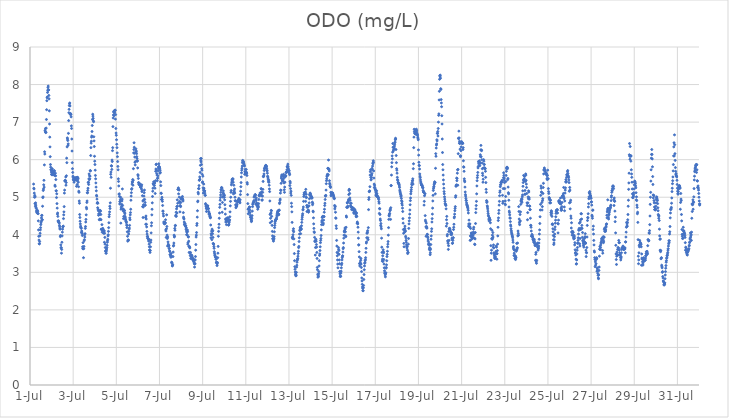
| Category | ODO (mg/L) |
|---|---|
| 44743.166666666664 | 5.35 |
| 44743.177083333336 | 5.24 |
| 44743.1875 | 5.22 |
| 44743.197916666664 | 5.11 |
| 44743.208333333336 | 5 |
| 44743.21875 | 5.05 |
| 44743.229166666664 | 4.83 |
| 44743.239583333336 | 5.01 |
| 44743.25 | 4.76 |
| 44743.260416666664 | 4.85 |
| 44743.270833333336 | 4.79 |
| 44743.28125 | 4.73 |
| 44743.291666666664 | 4.7 |
| 44743.302083333336 | 4.63 |
| 44743.3125 | 4.59 |
| 44743.322916666664 | 4.64 |
| 44743.333333333336 | 4.63 |
| 44743.34375 | 4.65 |
| 44743.354166666664 | 4.62 |
| 44743.364583333336 | 4.57 |
| 44743.375 | 4.56 |
| 44743.385416666664 | 4.37 |
| 44743.395833333336 | 4.13 |
| 44743.40625 | 3.96 |
| 44743.416666666664 | 3.86 |
| 44743.427083333336 | 3.76 |
| 44743.4375 | 3.76 |
| 44743.447916666664 | 3.82 |
| 44743.458333333336 | 3.97 |
| 44743.46875 | 4.04 |
| 44743.479166666664 | 4.13 |
| 44743.489583333336 | 4.19 |
| 44743.5 | 4.27 |
| 44743.510416666664 | 4.32 |
| 44743.520833333336 | 4.36 |
| 44743.53125 | 4.45 |
| 44743.541666666664 | 4.51 |
| 44743.552083333336 | 4.52 |
| 44743.5625 | 4.4 |
| 44743.572916666664 | 4.4 |
| 44743.583333333336 | 4.76 |
| 44743.59375 | 4.99 |
| 44743.604166666664 | 5.01 |
| 44743.614583333336 | 5.18 |
| 44743.625 | 5.22 |
| 44743.635416666664 | 5.33 |
| 44743.645833333336 | 5.45 |
| 44743.65625 | 5.27 |
| 44743.666666666664 | 5.86 |
| 44743.677083333336 | 6.21 |
| 44743.6875 | 6.15 |
| 44743.697916666664 | 6.78 |
| 44743.708333333336 | 6.74 |
| 44743.71875 | 6.83 |
| 44743.729166666664 | 6.72 |
| 44743.739583333336 | 6.73 |
| 44743.75 | 6.84 |
| 44743.760416666664 | 7.07 |
| 44743.770833333336 | 7.33 |
| 44743.78125 | 7.57 |
| 44743.791666666664 | 7.65 |
| 44743.802083333336 | 7.67 |
| 44743.8125 | 7.79 |
| 44743.822916666664 | 7.85 |
| 44743.833333333336 | 7.92 |
| 44743.84375 | 7.96 |
| 44743.854166666664 | 7.85 |
| 44743.864583333336 | 7.86 |
| 44743.875 | 7.71 |
| 44743.885416666664 | 7.62 |
| 44743.895833333336 | 7.3 |
| 44743.90625 | 6.95 |
| 44743.916666666664 | 6.6 |
| 44743.927083333336 | 6.34 |
| 44743.9375 | 6.08 |
| 44743.947916666664 | 5.87 |
| 44743.958333333336 | 5.8 |
| 44743.96875 | 5.73 |
| 44743.979166666664 | 5.73 |
| 44743.989583333336 | 5.67 |
| 44744.0 | 5.61 |
| 44744.010416666664 | 5.6 |
| 44744.020833333336 | 5.68 |
| 44744.03125 | 5.76 |
| 44744.041666666664 | 5.7 |
| 44744.052083333336 | 5.6 |
| 44744.0625 | 5.67 |
| 44744.072916666664 | 5.65 |
| 44744.083333333336 | 5.6 |
| 44744.09375 | 5.65 |
| 44744.104166666664 | 5.62 |
| 44744.114583333336 | 5.71 |
| 44744.125 | 5.62 |
| 44744.135416666664 | 5.7 |
| 44744.145833333336 | 5.58 |
| 44744.15625 | 5.32 |
| 44744.166666666664 | 5.29 |
| 44744.177083333336 | 5.64 |
| 44744.1875 | 5.57 |
| 44744.197916666664 | 5.47 |
| 44744.208333333336 | 5.17 |
| 44744.21875 | 5.17 |
| 44744.229166666664 | 4.99 |
| 44744.239583333336 | 5.09 |
| 44744.25 | 4.83 |
| 44744.260416666664 | 4.71 |
| 44744.270833333336 | 4.55 |
| 44744.28125 | 4.58 |
| 44744.291666666664 | 4.49 |
| 44744.302083333336 | 4.37 |
| 44744.3125 | 4.35 |
| 44744.322916666664 | 4.37 |
| 44744.333333333336 | 4.34 |
| 44744.34375 | 4.33 |
| 44744.354166666664 | 4.31 |
| 44744.364583333336 | 4.25 |
| 44744.375 | 4.21 |
| 44744.385416666664 | 4.16 |
| 44744.395833333336 | 4.15 |
| 44744.40625 | 3.95 |
| 44744.416666666664 | 3.98 |
| 44744.427083333336 | 3.73 |
| 44744.4375 | 3.65 |
| 44744.447916666664 | 3.66 |
| 44744.458333333336 | 3.51 |
| 44744.46875 | 3.61 |
| 44744.479166666664 | 3.8 |
| 44744.489583333336 | 3.97 |
| 44744.5 | 4.07 |
| 44744.510416666664 | 4.15 |
| 44744.520833333336 | 4.21 |
| 44744.53125 | 4.22 |
| 44744.541666666664 | 4.23 |
| 44744.552083333336 | 4.43 |
| 44744.5625 | 4.53 |
| 44744.572916666664 | 4.61 |
| 44744.583333333336 | 4.75 |
| 44744.59375 | 5.11 |
| 44744.604166666664 | 5.19 |
| 44744.614583333336 | 5.43 |
| 44744.625 | 5.44 |
| 44744.635416666664 | 5.45 |
| 44744.645833333336 | 5.44 |
| 44744.65625 | 5.54 |
| 44744.666666666664 | 5.32 |
| 44744.677083333336 | 5.39 |
| 44744.6875 | 5.57 |
| 44744.697916666664 | 6.04 |
| 44744.708333333336 | 5.92 |
| 44744.71875 | 6.34 |
| 44744.729166666664 | 6.58 |
| 44744.739583333336 | 6.55 |
| 44744.75 | 6.51 |
| 44744.760416666664 | 6.38 |
| 44744.770833333336 | 6.42 |
| 44744.78125 | 6.7 |
| 44744.791666666664 | 7.04 |
| 44744.802083333336 | 7.25 |
| 44744.8125 | 7.34 |
| 44744.822916666664 | 7.44 |
| 44744.833333333336 | 7.49 |
| 44744.84375 | 7.51 |
| 44744.854166666664 | 7.43 |
| 44744.864583333336 | 7.21 |
| 44744.875 | 7.23 |
| 44744.885416666664 | 7.2 |
| 44744.895833333336 | 7.21 |
| 44744.90625 | 7.14 |
| 44744.916666666664 | 6.9 |
| 44744.927083333336 | 6.83 |
| 44744.9375 | 6.55 |
| 44744.947916666664 | 6.23 |
| 44744.958333333336 | 5.92 |
| 44744.96875 | 5.76 |
| 44744.979166666664 | 5.66 |
| 44744.989583333336 | 5.56 |
| 44745.0 | 5.52 |
| 44745.010416666664 | 5.47 |
| 44745.020833333336 | 5.46 |
| 44745.03125 | 5.46 |
| 44745.041666666664 | 5.4 |
| 44745.052083333336 | 5.45 |
| 44745.0625 | 5.5 |
| 44745.072916666664 | 5.52 |
| 44745.083333333336 | 5.5 |
| 44745.09375 | 5.48 |
| 44745.104166666664 | 5.49 |
| 44745.114583333336 | 5.52 |
| 44745.125 | 5.49 |
| 44745.135416666664 | 5.45 |
| 44745.15625 | 5.29 |
| 44745.166666666664 | 5.52 |
| 44745.177083333336 | 5.53 |
| 44745.1875 | 5.34 |
| 44745.197916666664 | 5.44 |
| 44745.208333333336 | 5.53 |
| 44745.21875 | 5.51 |
| 44745.229166666664 | 5.49 |
| 44745.239583333336 | 5.4 |
| 44745.25 | 5.28 |
| 44745.260416666664 | 5.16 |
| 44745.270833333336 | 5.13 |
| 44745.28125 | 4.9 |
| 44745.291666666664 | 4.84 |
| 44745.302083333336 | 4.54 |
| 44745.3125 | 4.46 |
| 44745.322916666664 | 4.36 |
| 44745.333333333336 | 4.29 |
| 44745.34375 | 4.23 |
| 44745.354166666664 | 4.2 |
| 44745.364583333336 | 4.19 |
| 44745.375 | 4.17 |
| 44745.385416666664 | 4.06 |
| 44745.395833333336 | 4.1 |
| 44745.40625 | 4.07 |
| 44745.416666666664 | 4.03 |
| 44745.427083333336 | 3.98 |
| 44745.4375 | 3.68 |
| 44745.447916666664 | 3.63 |
| 44745.458333333336 | 3.79 |
| 44745.46875 | 3.63 |
| 44745.479166666664 | 3.39 |
| 44745.489583333336 | 3.63 |
| 44745.5 | 3.69 |
| 44745.510416666664 | 3.84 |
| 44745.520833333336 | 3.87 |
| 44745.53125 | 4 |
| 44745.541666666664 | 3.94 |
| 44745.552083333336 | 4.03 |
| 44745.5625 | 4.17 |
| 44745.572916666664 | 4.22 |
| 44745.583333333336 | 4.34 |
| 44745.59375 | 4.41 |
| 44745.604166666664 | 4.53 |
| 44745.614583333336 | 4.73 |
| 44745.625 | 4.69 |
| 44745.635416666664 | 4.86 |
| 44745.645833333336 | 4.9 |
| 44745.65625 | 5.12 |
| 44745.666666666664 | 5.12 |
| 44745.677083333336 | 5.18 |
| 44745.6875 | 5.24 |
| 44745.697916666664 | 5.39 |
| 44745.708333333336 | 5.4 |
| 44745.71875 | 5.34 |
| 44745.729166666664 | 5.49 |
| 44745.739583333336 | 5.62 |
| 44745.75 | 5.47 |
| 44745.760416666664 | 5.57 |
| 44745.770833333336 | 5.49 |
| 44745.78125 | 5.56 |
| 44745.791666666664 | 5.71 |
| 44745.802083333336 | 5.7 |
| 44745.8125 | 6.11 |
| 44745.822916666664 | 6.32 |
| 44745.833333333336 | 6.44 |
| 44745.84375 | 6.49 |
| 44745.854166666664 | 6.6 |
| 44745.864583333336 | 6.63 |
| 44745.875 | 6.75 |
| 44745.885416666664 | 6.91 |
| 44745.895833333336 | 7.07 |
| 44745.90625 | 7.21 |
| 44745.916666666664 | 7.16 |
| 44745.927083333336 | 7.1 |
| 44745.9375 | 7.03 |
| 44745.947916666664 | 7.01 |
| 44745.958333333336 | 6.61 |
| 44745.96875 | 6.5 |
| 44745.979166666664 | 6.35 |
| 44745.989583333336 | 6.09 |
| 44746.0 | 5.96 |
| 44746.010416666664 | 5.87 |
| 44746.020833333336 | 5.72 |
| 44746.03125 | 5.58 |
| 44746.041666666664 | 5.49 |
| 44746.052083333336 | 5.38 |
| 44746.0625 | 5.27 |
| 44746.072916666664 | 5.17 |
| 44746.083333333336 | 5.05 |
| 44746.09375 | 5.03 |
| 44746.104166666664 | 4.95 |
| 44746.114583333336 | 4.84 |
| 44746.125 | 4.86 |
| 44746.135416666664 | 4.72 |
| 44746.145833333336 | 4.84 |
| 44746.15625 | 4.68 |
| 44746.166666666664 | 4.64 |
| 44746.177083333336 | 4.52 |
| 44746.1875 | 4.56 |
| 44746.197916666664 | 4.64 |
| 44746.208333333336 | 4.4 |
| 44746.21875 | 4.54 |
| 44746.229166666664 | 4.57 |
| 44746.239583333336 | 4.42 |
| 44746.25 | 4.65 |
| 44746.260416666664 | 4.41 |
| 44746.270833333336 | 4.63 |
| 44746.28125 | 4.54 |
| 44746.291666666664 | 4.4 |
| 44746.302083333336 | 4.15 |
| 44746.3125 | 4.14 |
| 44746.322916666664 | 4.14 |
| 44746.333333333336 | 4.27 |
| 44746.34375 | 4.07 |
| 44746.354166666664 | 4.15 |
| 44746.364583333336 | 4.15 |
| 44746.375 | 4.17 |
| 44746.385416666664 | 4.12 |
| 44746.395833333336 | 4.12 |
| 44746.40625 | 4.04 |
| 44746.416666666664 | 4.08 |
| 44746.427083333336 | 4.11 |
| 44746.4375 | 4.1 |
| 44746.447916666664 | 3.8 |
| 44746.458333333336 | 4.04 |
| 44746.46875 | 3.93 |
| 44746.479166666664 | 3.75 |
| 44746.489583333336 | 3.66 |
| 44746.5 | 3.56 |
| 44746.510416666664 | 3.58 |
| 44746.520833333336 | 3.51 |
| 44746.53125 | 3.51 |
| 44746.541666666664 | 3.57 |
| 44746.552083333336 | 3.62 |
| 44746.5625 | 3.66 |
| 44746.572916666664 | 3.72 |
| 44746.583333333336 | 3.8 |
| 44746.59375 | 3.84 |
| 44746.604166666664 | 3.88 |
| 44746.614583333336 | 3.97 |
| 44746.625 | 4 |
| 44746.635416666664 | 4.09 |
| 44746.645833333336 | 4.19 |
| 44746.65625 | 4.32 |
| 44746.666666666664 | 4.48 |
| 44746.677083333336 | 4.54 |
| 44746.6875 | 4.61 |
| 44746.697916666664 | 4.76 |
| 44746.708333333336 | 4.7 |
| 44746.71875 | 4.85 |
| 44746.729166666664 | 5.24 |
| 44746.739583333336 | 5.61 |
| 44746.75 | 5.67 |
| 44746.760416666664 | 5.53 |
| 44746.770833333336 | 5.84 |
| 44746.78125 | 5.83 |
| 44746.791666666664 | 5.74 |
| 44746.802083333336 | 5.99 |
| 44746.8125 | 5.95 |
| 44746.822916666664 | 6.24 |
| 44746.833333333336 | 6.32 |
| 44746.84375 | 6.88 |
| 44746.854166666664 | 7.11 |
| 44746.864583333336 | 7.19 |
| 44746.875 | 7.27 |
| 44746.885416666664 | 7.29 |
| 44746.895833333336 | 7.17 |
| 44746.90625 | 7.26 |
| 44746.916666666664 | 7.25 |
| 44746.927083333336 | 7.31 |
| 44746.9375 | 7.31 |
| 44746.947916666664 | 7.32 |
| 44746.958333333336 | 7.08 |
| 44746.96875 | 7.2 |
| 44746.979166666664 | 6.83 |
| 44746.989583333336 | 6.71 |
| 44747.0 | 6.65 |
| 44747.010416666664 | 6.53 |
| 44747.020833333336 | 6.41 |
| 44747.03125 | 6.32 |
| 44747.041666666664 | 6.18 |
| 44747.052083333336 | 6.08 |
| 44747.0625 | 5.95 |
| 44747.072916666664 | 5.82 |
| 44747.083333333336 | 5.73 |
| 44747.09375 | 5.49 |
| 44747.104166666664 | 5.42 |
| 44747.114583333336 | 5.3 |
| 44747.125 | 5.08 |
| 44747.135416666664 | 5.09 |
| 44747.145833333336 | 5.02 |
| 44747.15625 | 4.82 |
| 44747.166666666664 | 4.88 |
| 44747.177083333336 | 4.89 |
| 44747.1875 | 4.94 |
| 44747.197916666664 | 5 |
| 44747.208333333336 | 4.31 |
| 44747.21875 | 4.68 |
| 44747.229166666664 | 4.72 |
| 44747.239583333336 | 4.76 |
| 44747.25 | 4.81 |
| 44747.260416666664 | 4.9 |
| 44747.270833333336 | 4.95 |
| 44747.28125 | 5.22 |
| 44747.291666666664 | 4.78 |
| 44747.302083333336 | 4.68 |
| 44747.3125 | 4.69 |
| 44747.322916666664 | 4.63 |
| 44747.333333333336 | 4.43 |
| 44747.34375 | 4.49 |
| 44747.354166666664 | 4.66 |
| 44747.364583333336 | 4.65 |
| 44747.375 | 4.64 |
| 44747.385416666664 | 4.59 |
| 44747.395833333336 | 4.56 |
| 44747.40625 | 4.49 |
| 44747.416666666664 | 4.45 |
| 44747.427083333336 | 4.41 |
| 44747.4375 | 4.39 |
| 44747.447916666664 | 4.36 |
| 44747.458333333336 | 4.35 |
| 44747.46875 | 4.32 |
| 44747.479166666664 | 4.26 |
| 44747.489583333336 | 4.19 |
| 44747.5 | 4.25 |
| 44747.510416666664 | 4.08 |
| 44747.520833333336 | 3.96 |
| 44747.53125 | 3.83 |
| 44747.541666666664 | 3.86 |
| 44747.552083333336 | 3.85 |
| 44747.5625 | 3.86 |
| 44747.572916666664 | 4.02 |
| 44747.583333333336 | 4.09 |
| 44747.59375 | 4.15 |
| 44747.604166666664 | 4.18 |
| 44747.614583333336 | 4.25 |
| 44747.625 | 4.45 |
| 44747.635416666664 | 4.4 |
| 44747.645833333336 | 4.53 |
| 44747.65625 | 4.59 |
| 44747.666666666664 | 4.68 |
| 44747.677083333336 | 4.92 |
| 44747.6875 | 5.03 |
| 44747.697916666664 | 5.12 |
| 44747.708333333336 | 5.21 |
| 44747.71875 | 5.23 |
| 44747.729166666664 | 5.35 |
| 44747.739583333336 | 5.41 |
| 44747.75 | 5.4 |
| 44747.760416666664 | 5.47 |
| 44747.770833333336 | 5.32 |
| 44747.78125 | 5.45 |
| 44747.791666666664 | 5.76 |
| 44747.802083333336 | 6.18 |
| 44747.8125 | 6.27 |
| 44747.822916666664 | 6.45 |
| 44747.833333333336 | 6.33 |
| 44747.84375 | 6.17 |
| 44747.854166666664 | 6.07 |
| 44747.864583333336 | 5.93 |
| 44747.875 | 5.86 |
| 44747.885416666664 | 5.95 |
| 44747.895833333336 | 6.2 |
| 44747.90625 | 6.29 |
| 44747.916666666664 | 6.24 |
| 44747.927083333336 | 6.21 |
| 44747.9375 | 6.16 |
| 44747.947916666664 | 6.08 |
| 44747.958333333336 | 6.03 |
| 44747.96875 | 5.96 |
| 44747.979166666664 | 5.97 |
| 44747.989583333336 | 5.78 |
| 44748.0 | 5.6 |
| 44748.010416666664 | 5.57 |
| 44748.020833333336 | 5.5 |
| 44748.03125 | 5.39 |
| 44748.041666666664 | 5.38 |
| 44748.052083333336 | 5.34 |
| 44748.0625 | 5.34 |
| 44748.072916666664 | 5.33 |
| 44748.083333333336 | 5.36 |
| 44748.09375 | 5.33 |
| 44748.104166666664 | 5.33 |
| 44748.114583333336 | 5.27 |
| 44748.125 | 5.28 |
| 44748.135416666664 | 5.26 |
| 44748.145833333336 | 5.3 |
| 44748.15625 | 5.28 |
| 44748.166666666664 | 5.22 |
| 44748.177083333336 | 5.33 |
| 44748.1875 | 5.15 |
| 44748.197916666664 | 5.17 |
| 44748.208333333336 | 5.04 |
| 44748.21875 | 4.75 |
| 44748.229166666664 | 4.9 |
| 44748.239583333336 | 4.46 |
| 44748.25 | 4.74 |
| 44748.260416666664 | 4.8 |
| 44748.270833333336 | 4.93 |
| 44748.28125 | 5.03 |
| 44748.291666666664 | 5.12 |
| 44748.302083333336 | 5.19 |
| 44748.3125 | 4.94 |
| 44748.322916666664 | 4.78 |
| 44748.333333333336 | 4.86 |
| 44748.34375 | 4.79 |
| 44748.354166666664 | 4.46 |
| 44748.364583333336 | 4.28 |
| 44748.375 | 4.5 |
| 44748.385416666664 | 4.42 |
| 44748.395833333336 | 4.28 |
| 44748.40625 | 4.21 |
| 44748.416666666664 | 4.09 |
| 44748.427083333336 | 4.02 |
| 44748.4375 | 3.95 |
| 44748.447916666664 | 3.96 |
| 44748.458333333336 | 3.91 |
| 44748.46875 | 3.9 |
| 44748.479166666664 | 3.9 |
| 44748.489583333336 | 3.87 |
| 44748.5 | 3.83 |
| 44748.510416666664 | 3.87 |
| 44748.520833333336 | 3.75 |
| 44748.53125 | 3.68 |
| 44748.541666666664 | 3.6 |
| 44748.552083333336 | 3.58 |
| 44748.5625 | 3.53 |
| 44748.572916666664 | 3.58 |
| 44748.583333333336 | 3.68 |
| 44748.59375 | 3.8 |
| 44748.604166666664 | 3.86 |
| 44748.614583333336 | 4.05 |
| 44748.625 | 4.24 |
| 44748.635416666664 | 4.32 |
| 44748.645833333336 | 4.53 |
| 44748.65625 | 4.68 |
| 44748.666666666664 | 4.85 |
| 44748.677083333336 | 5.02 |
| 44748.6875 | 5.16 |
| 44748.697916666664 | 5.24 |
| 44748.708333333336 | 5.36 |
| 44748.71875 | 5.35 |
| 44748.729166666664 | 5.41 |
| 44748.739583333336 | 5.35 |
| 44748.75 | 5.32 |
| 44748.760416666664 | 5.31 |
| 44748.770833333336 | 5.38 |
| 44748.78125 | 5.38 |
| 44748.791666666664 | 5.24 |
| 44748.802083333336 | 5.1 |
| 44748.8125 | 5.44 |
| 44748.822916666664 | 5.69 |
| 44748.833333333336 | 5.75 |
| 44748.84375 | 5.87 |
| 44748.854166666664 | 5.88 |
| 44748.864583333336 | 5.72 |
| 44748.875 | 5.63 |
| 44748.885416666664 | 5.59 |
| 44748.895833333336 | 5.44 |
| 44748.90625 | 5.5 |
| 44748.916666666664 | 5.51 |
| 44748.927083333336 | 5.57 |
| 44748.9375 | 5.7 |
| 44748.947916666664 | 5.8 |
| 44748.958333333336 | 5.76 |
| 44748.96875 | 5.89 |
| 44748.979166666664 | 5.82 |
| 44748.989583333336 | 5.81 |
| 44749.0 | 5.79 |
| 44749.010416666664 | 5.77 |
| 44749.020833333336 | 5.64 |
| 44749.03125 | 5.72 |
| 44749.041666666664 | 5.66 |
| 44749.052083333336 | 5.41 |
| 44749.0625 | 5.31 |
| 44749.072916666664 | 5.11 |
| 44749.083333333336 | 5.1 |
| 44749.09375 | 4.94 |
| 44749.104166666664 | 4.94 |
| 44749.114583333336 | 5 |
| 44749.125 | 4.94 |
| 44749.135416666664 | 4.89 |
| 44749.145833333336 | 4.78 |
| 44749.15625 | 4.63 |
| 44749.166666666664 | 4.63 |
| 44749.177083333336 | 4.56 |
| 44749.1875 | 4.5 |
| 44749.197916666664 | 4.34 |
| 44749.208333333336 | 4.31 |
| 44749.21875 | 4.31 |
| 44749.229166666664 | 4.29 |
| 44749.239583333336 | 4.33 |
| 44749.25 | 4.32 |
| 44749.260416666664 | 4.3 |
| 44749.270833333336 | 4.32 |
| 44749.28125 | 4.4 |
| 44749.291666666664 | 4.13 |
| 44749.302083333336 | 4.1 |
| 44749.3125 | 3.93 |
| 44749.322916666664 | 4.16 |
| 44749.333333333336 | 4.53 |
| 44749.34375 | 4.22 |
| 44749.354166666664 | 3.99 |
| 44749.364583333336 | 3.9 |
| 44749.375 | 3.7 |
| 44749.385416666664 | 3.94 |
| 44749.395833333336 | 3.81 |
| 44749.40625 | 3.75 |
| 44749.416666666664 | 3.72 |
| 44749.427083333336 | 3.7 |
| 44749.4375 | 3.71 |
| 44749.447916666664 | 3.63 |
| 44749.458333333336 | 3.64 |
| 44749.46875 | 3.57 |
| 44749.479166666664 | 3.55 |
| 44749.489583333336 | 3.47 |
| 44749.5 | 3.47 |
| 44749.510416666664 | 3.45 |
| 44749.520833333336 | 3.43 |
| 44749.53125 | 3.4 |
| 44749.541666666664 | 3.5 |
| 44749.552083333336 | 3.43 |
| 44749.5625 | 3.27 |
| 44749.572916666664 | 3.26 |
| 44749.583333333336 | 3.24 |
| 44749.59375 | 3.17 |
| 44749.604166666664 | 3.18 |
| 44749.614583333336 | 3.2 |
| 44749.625 | 3.42 |
| 44749.635416666664 | 3.54 |
| 44749.645833333336 | 3.7 |
| 44749.65625 | 3.72 |
| 44749.666666666664 | 3.78 |
| 44749.677083333336 | 3.99 |
| 44749.6875 | 3.94 |
| 44749.697916666664 | 3.96 |
| 44749.708333333336 | 4.17 |
| 44749.71875 | 4.12 |
| 44749.729166666664 | 4.24 |
| 44749.739583333336 | 4.25 |
| 44749.75 | 4.5 |
| 44749.760416666664 | 4.52 |
| 44749.770833333336 | 4.6 |
| 44749.78125 | 4.49 |
| 44749.791666666664 | 4.69 |
| 44749.802083333336 | 4.75 |
| 44749.8125 | 4.58 |
| 44749.822916666664 | 4.93 |
| 44749.833333333336 | 4.76 |
| 44749.84375 | 4.84 |
| 44749.854166666664 | 5.21 |
| 44749.864583333336 | 5.21 |
| 44749.875 | 5.25 |
| 44749.885416666664 | 5.09 |
| 44749.895833333336 | 5.21 |
| 44749.90625 | 5.19 |
| 44749.916666666664 | 5 |
| 44749.927083333336 | 4.89 |
| 44749.9375 | 4.86 |
| 44749.947916666664 | 4.61 |
| 44749.958333333336 | 4.78 |
| 44749.96875 | 4.76 |
| 44749.979166666664 | 4.75 |
| 44749.989583333336 | 4.86 |
| 44750.0 | 4.95 |
| 44750.010416666664 | 4.99 |
| 44750.020833333336 | 4.96 |
| 44750.03125 | 4.96 |
| 44750.041666666664 | 4.96 |
| 44750.052083333336 | 4.98 |
| 44750.0625 | 5.02 |
| 44750.072916666664 | 4.95 |
| 44750.083333333336 | 4.93 |
| 44750.09375 | 4.9 |
| 44750.104166666664 | 4.59 |
| 44750.114583333336 | 4.47 |
| 44750.125 | 4.44 |
| 44750.135416666664 | 4.42 |
| 44750.145833333336 | 4.34 |
| 44750.15625 | 4.28 |
| 44750.166666666664 | 4.27 |
| 44750.177083333336 | 4.26 |
| 44750.1875 | 4.3 |
| 44750.197916666664 | 4.24 |
| 44750.208333333336 | 4.23 |
| 44750.21875 | 4.24 |
| 44750.229166666664 | 4.15 |
| 44750.239583333336 | 4.19 |
| 44750.25 | 4.1 |
| 44750.260416666664 | 4 |
| 44750.270833333336 | 4.06 |
| 44750.28125 | 4 |
| 44750.291666666664 | 4.13 |
| 44750.302083333336 | 4.09 |
| 44750.3125 | 3.75 |
| 44750.322916666664 | 3.79 |
| 44750.333333333336 | 3.94 |
| 44750.34375 | 3.95 |
| 44750.354166666664 | 3.83 |
| 44750.364583333336 | 3.69 |
| 44750.375 | 3.53 |
| 44750.385416666664 | 3.69 |
| 44750.395833333336 | 3.67 |
| 44750.40625 | 3.65 |
| 44750.416666666664 | 3.51 |
| 44750.427083333336 | 3.45 |
| 44750.4375 | 3.53 |
| 44750.447916666664 | 3.37 |
| 44750.458333333336 | 3.42 |
| 44750.46875 | 3.46 |
| 44750.479166666664 | 3.45 |
| 44750.489583333336 | 3.42 |
| 44750.5 | 3.45 |
| 44750.510416666664 | 3.41 |
| 44750.520833333336 | 3.35 |
| 44750.53125 | 3.38 |
| 44750.541666666664 | 3.34 |
| 44750.552083333336 | 3.36 |
| 44750.5625 | 3.31 |
| 44750.572916666664 | 3.35 |
| 44750.583333333336 | 3.34 |
| 44750.59375 | 3.3 |
| 44750.604166666664 | 3.26 |
| 44750.614583333336 | 3.23 |
| 44750.625 | 3.14 |
| 44750.635416666664 | 3.22 |
| 44750.645833333336 | 3.23 |
| 44750.65625 | 3.33 |
| 44750.666666666664 | 3.42 |
| 44750.677083333336 | 3.59 |
| 44750.6875 | 3.74 |
| 44750.697916666664 | 3.94 |
| 44750.708333333336 | 3.99 |
| 44750.71875 | 4.06 |
| 44750.729166666664 | 4.25 |
| 44750.739583333336 | 4.3 |
| 44750.75 | 4.47 |
| 44750.760416666664 | 4.64 |
| 44750.770833333336 | 4.88 |
| 44750.78125 | 4.9 |
| 44750.791666666664 | 5.13 |
| 44750.802083333336 | 5.09 |
| 44750.8125 | 5.23 |
| 44750.822916666664 | 5.23 |
| 44750.833333333336 | 5.31 |
| 44750.84375 | 5.45 |
| 44750.854166666664 | 5.46 |
| 44750.864583333336 | 5.54 |
| 44750.875 | 5.48 |
| 44750.885416666664 | 5.66 |
| 44750.895833333336 | 5.85 |
| 44750.90625 | 6.03 |
| 44750.916666666664 | 5.97 |
| 44750.927083333336 | 5.94 |
| 44750.9375 | 6.03 |
| 44750.947916666664 | 5.87 |
| 44750.958333333336 | 5.76 |
| 44750.96875 | 5.72 |
| 44750.979166666664 | 5.61 |
| 44750.989583333336 | 5.39 |
| 44751.0 | 5.41 |
| 44751.010416666664 | 5.56 |
| 44751.020833333336 | 5.25 |
| 44751.03125 | 5.11 |
| 44751.041666666664 | 5.19 |
| 44751.052083333336 | 5.35 |
| 44751.0625 | 5.24 |
| 44751.072916666664 | 5.16 |
| 44751.083333333336 | 5.17 |
| 44751.09375 | 5.17 |
| 44751.104166666664 | 5.11 |
| 44751.114583333336 | 5.05 |
| 44751.125 | 5.05 |
| 44751.135416666664 | 4.83 |
| 44751.145833333336 | 4.8 |
| 44751.15625 | 4.76 |
| 44751.166666666664 | 4.71 |
| 44751.177083333336 | 4.62 |
| 44751.1875 | 4.7 |
| 44751.197916666664 | 4.68 |
| 44751.208333333336 | 4.76 |
| 44751.21875 | 4.74 |
| 44751.229166666664 | 4.77 |
| 44751.239583333336 | 4.77 |
| 44751.25 | 4.7 |
| 44751.260416666664 | 4.69 |
| 44751.270833333336 | 4.7 |
| 44751.28125 | 4.62 |
| 44751.291666666664 | 4.58 |
| 44751.302083333336 | 4.54 |
| 44751.3125 | 4.57 |
| 44751.322916666664 | 4.55 |
| 44751.333333333336 | 4.48 |
| 44751.34375 | 4.5 |
| 44751.354166666664 | 4.45 |
| 44751.364583333336 | 4.46 |
| 44751.375 | 4.26 |
| 44751.385416666664 | 3.92 |
| 44751.395833333336 | 4.03 |
| 44751.40625 | 3.99 |
| 44751.416666666664 | 4.1 |
| 44751.427083333336 | 3.87 |
| 44751.4375 | 4.15 |
| 44751.447916666664 | 4.09 |
| 44751.458333333336 | 4.03 |
| 44751.46875 | 4.11 |
| 44751.479166666664 | 3.93 |
| 44751.489583333336 | 3.77 |
| 44751.5 | 3.76 |
| 44751.510416666664 | 3.75 |
| 44751.520833333336 | 3.69 |
| 44751.53125 | 3.64 |
| 44751.541666666664 | 3.55 |
| 44751.552083333336 | 3.51 |
| 44751.5625 | 3.46 |
| 44751.572916666664 | 3.46 |
| 44751.583333333336 | 3.41 |
| 44751.59375 | 3.42 |
| 44751.604166666664 | 3.4 |
| 44751.614583333336 | 3.35 |
| 44751.625 | 3.35 |
| 44751.635416666664 | 3.27 |
| 44751.645833333336 | 3.25 |
| 44751.65625 | 3.26 |
| 44751.666666666664 | 3.18 |
| 44751.677083333336 | 3.23 |
| 44751.6875 | 3.26 |
| 44751.697916666664 | 3.39 |
| 44751.708333333336 | 3.51 |
| 44751.71875 | 3.69 |
| 44751.729166666664 | 3.96 |
| 44751.739583333336 | 4.09 |
| 44751.75 | 4.19 |
| 44751.760416666664 | 4.28 |
| 44751.770833333336 | 4.44 |
| 44751.78125 | 4.58 |
| 44751.791666666664 | 4.73 |
| 44751.802083333336 | 4.81 |
| 44751.8125 | 4.92 |
| 44751.822916666664 | 4.99 |
| 44751.833333333336 | 5.06 |
| 44751.84375 | 5.13 |
| 44751.854166666664 | 5.2 |
| 44751.864583333336 | 5.2 |
| 44751.875 | 5.26 |
| 44751.885416666664 | 5.25 |
| 44751.895833333336 | 5.24 |
| 44751.90625 | 4.6 |
| 44751.916666666664 | 4.86 |
| 44751.927083333336 | 5.01 |
| 44751.9375 | 5.01 |
| 44751.947916666664 | 5.12 |
| 44751.958333333336 | 5.17 |
| 44751.96875 | 5.09 |
| 44751.979166666664 | 5.07 |
| 44751.989583333336 | 5 |
| 44752.0 | 5 |
| 44752.010416666664 | 5.05 |
| 44752.020833333336 | 4.93 |
| 44752.03125 | 4.8 |
| 44752.041666666664 | 4.69 |
| 44752.052083333336 | 4.55 |
| 44752.0625 | 4.42 |
| 44752.072916666664 | 4.34 |
| 44752.083333333336 | 4.39 |
| 44752.09375 | 4.41 |
| 44752.104166666664 | 4.27 |
| 44752.114583333336 | 4.36 |
| 44752.125 | 4.38 |
| 44752.135416666664 | 4.45 |
| 44752.145833333336 | 4.41 |
| 44752.15625 | 4.4 |
| 44752.166666666664 | 4.44 |
| 44752.177083333336 | 4.45 |
| 44752.1875 | 4.35 |
| 44752.197916666664 | 4.26 |
| 44752.208333333336 | 4.26 |
| 44752.21875 | 4.28 |
| 44752.229166666664 | 4.33 |
| 44752.239583333336 | 4.37 |
| 44752.25 | 4.4 |
| 44752.260416666664 | 4.48 |
| 44752.270833333336 | 4.61 |
| 44752.28125 | 4.77 |
| 44752.291666666664 | 4.89 |
| 44752.302083333336 | 5 |
| 44752.3125 | 5.13 |
| 44752.322916666664 | 5.18 |
| 44752.333333333336 | 5.33 |
| 44752.34375 | 5.38 |
| 44752.354166666664 | 5.43 |
| 44752.364583333336 | 5.47 |
| 44752.375 | 5.46 |
| 44752.385416666664 | 5.49 |
| 44752.395833333336 | 5.47 |
| 44752.40625 | 5.49 |
| 44752.416666666664 | 5.4 |
| 44752.427083333336 | 5.09 |
| 44752.4375 | 5.13 |
| 44752.447916666664 | 5.32 |
| 44752.458333333336 | 5.18 |
| 44752.46875 | 5.14 |
| 44752.479166666664 | 5.22 |
| 44752.489583333336 | 5.11 |
| 44752.5 | 5 |
| 44752.510416666664 | 4.91 |
| 44752.520833333336 | 4.9 |
| 44752.53125 | 4.8 |
| 44752.541666666664 | 4.72 |
| 44752.552083333336 | 4.78 |
| 44752.5625 | 4.75 |
| 44752.572916666664 | 4.76 |
| 44752.583333333336 | 4.79 |
| 44752.59375 | 4.81 |
| 44752.604166666664 | 4.87 |
| 44752.614583333336 | 4.9 |
| 44752.625 | 4.91 |
| 44752.635416666664 | 4.92 |
| 44752.645833333336 | 4.92 |
| 44752.65625 | 4.88 |
| 44752.666666666664 | 4.92 |
| 44752.677083333336 | 4.97 |
| 44752.6875 | 4.88 |
| 44752.697916666664 | 4.89 |
| 44752.708333333336 | 4.88 |
| 44752.71875 | 4.87 |
| 44752.729166666664 | 4.85 |
| 44752.739583333336 | 4.93 |
| 44752.75 | 5.07 |
| 44752.760416666664 | 5.16 |
| 44752.770833333336 | 5.28 |
| 44752.78125 | 5.39 |
| 44752.791666666664 | 5.54 |
| 44752.802083333336 | 5.65 |
| 44752.8125 | 5.72 |
| 44752.822916666664 | 5.77 |
| 44752.833333333336 | 5.83 |
| 44752.84375 | 5.92 |
| 44752.854166666664 | 5.98 |
| 44752.864583333336 | 5.96 |
| 44752.875 | 5.96 |
| 44752.885416666664 | 5.94 |
| 44752.895833333336 | 5.93 |
| 44752.90625 | 5.9 |
| 44752.916666666664 | 5.87 |
| 44752.927083333336 | 5.85 |
| 44752.9375 | 5.83 |
| 44752.947916666664 | 5.61 |
| 44752.958333333336 | 5.68 |
| 44752.96875 | 5.74 |
| 44752.979166666664 | 5.62 |
| 44752.989583333336 | 5.63 |
| 44753.0 | 5.67 |
| 44753.010416666664 | 5.67 |
| 44753.020833333336 | 5.74 |
| 44753.03125 | 5.66 |
| 44753.041666666664 | 5.64 |
| 44753.052083333336 | 5.58 |
| 44753.0625 | 5.39 |
| 44753.072916666664 | 5.35 |
| 44753.083333333336 | 5.07 |
| 44753.09375 | 4.83 |
| 44753.104166666664 | 4.68 |
| 44753.114583333336 | 4.56 |
| 44753.125 | 4.68 |
| 44753.135416666664 | 4.7 |
| 44753.145833333336 | 4.61 |
| 44753.15625 | 4.73 |
| 44753.166666666664 | 4.74 |
| 44753.177083333336 | 4.73 |
| 44753.1875 | 4.66 |
| 44753.197916666664 | 4.59 |
| 44753.208333333336 | 4.52 |
| 44753.21875 | 4.47 |
| 44753.229166666664 | 4.46 |
| 44753.239583333336 | 4.42 |
| 44753.25 | 4.4 |
| 44753.260416666664 | 4.35 |
| 44753.270833333336 | 4.37 |
| 44753.28125 | 4.44 |
| 44753.291666666664 | 4.51 |
| 44753.302083333336 | 4.63 |
| 44753.3125 | 4.75 |
| 44753.322916666664 | 4.81 |
| 44753.333333333336 | 4.83 |
| 44753.34375 | 4.85 |
| 44753.354166666664 | 4.86 |
| 44753.364583333336 | 4.88 |
| 44753.375 | 4.91 |
| 44753.385416666664 | 5 |
| 44753.395833333336 | 5.02 |
| 44753.40625 | 5.02 |
| 44753.416666666664 | 5.03 |
| 44753.427083333336 | 5.06 |
| 44753.4375 | 5.07 |
| 44753.447916666664 | 5.06 |
| 44753.458333333336 | 4.93 |
| 44753.46875 | 4.81 |
| 44753.479166666664 | 4.91 |
| 44753.489583333336 | 4.98 |
| 44753.5 | 4.85 |
| 44753.510416666664 | 4.83 |
| 44753.520833333336 | 4.8 |
| 44753.53125 | 4.76 |
| 44753.541666666664 | 4.78 |
| 44753.552083333336 | 4.68 |
| 44753.5625 | 4.72 |
| 44753.572916666664 | 4.73 |
| 44753.583333333336 | 4.76 |
| 44753.59375 | 4.83 |
| 44753.604166666664 | 4.94 |
| 44753.614583333336 | 5.05 |
| 44753.625 | 5.04 |
| 44753.635416666664 | 5.04 |
| 44753.645833333336 | 5.06 |
| 44753.65625 | 5.11 |
| 44753.666666666664 | 5.08 |
| 44753.677083333336 | 5.06 |
| 44753.6875 | 5.1 |
| 44753.697916666664 | 5.07 |
| 44753.708333333336 | 5.23 |
| 44753.71875 | 5.22 |
| 44753.729166666664 | 5.14 |
| 44753.739583333336 | 5.04 |
| 44753.75 | 4.92 |
| 44753.760416666664 | 4.93 |
| 44753.770833333336 | 5.03 |
| 44753.78125 | 5.13 |
| 44753.791666666664 | 5.21 |
| 44753.802083333336 | 5.42 |
| 44753.8125 | 5.55 |
| 44753.822916666664 | 5.55 |
| 44753.833333333336 | 5.57 |
| 44753.84375 | 5.62 |
| 44753.854166666664 | 5.71 |
| 44753.864583333336 | 5.76 |
| 44753.875 | 5.76 |
| 44753.885416666664 | 5.79 |
| 44753.895833333336 | 5.8 |
| 44753.90625 | 5.82 |
| 44753.916666666664 | 5.84 |
| 44753.927083333336 | 5.85 |
| 44753.9375 | 5.84 |
| 44753.947916666664 | 5.82 |
| 44753.958333333336 | 5.82 |
| 44753.96875 | 5.77 |
| 44753.979166666664 | 5.72 |
| 44753.989583333336 | 5.7 |
| 44754.0 | 5.64 |
| 44754.010416666664 | 5.56 |
| 44754.020833333336 | 5.54 |
| 44754.03125 | 5.51 |
| 44754.041666666664 | 5.47 |
| 44754.052083333336 | 5.41 |
| 44754.0625 | 5.45 |
| 44754.072916666664 | 5.4 |
| 44754.083333333336 | 5.32 |
| 44754.09375 | 5.22 |
| 44754.104166666664 | 5.15 |
| 44754.114583333336 | 4.9 |
| 44754.125 | 4.54 |
| 44754.135416666664 | 4.32 |
| 44754.145833333336 | 4.44 |
| 44754.15625 | 4.57 |
| 44754.166666666664 | 4.58 |
| 44754.177083333336 | 4.65 |
| 44754.1875 | 4.64 |
| 44754.197916666664 | 4.49 |
| 44754.208333333336 | 4.36 |
| 44754.21875 | 4.25 |
| 44754.229166666664 | 4.09 |
| 44754.239583333336 | 3.97 |
| 44754.25 | 3.9 |
| 44754.260416666664 | 3.89 |
| 44754.270833333336 | 3.87 |
| 44754.28125 | 3.83 |
| 44754.291666666664 | 3.87 |
| 44754.302083333336 | 3.9 |
| 44754.3125 | 3.95 |
| 44754.322916666664 | 4.08 |
| 44754.333333333336 | 4.19 |
| 44754.34375 | 4.25 |
| 44754.354166666664 | 4.31 |
| 44754.364583333336 | 4.36 |
| 44754.375 | 4.38 |
| 44754.385416666664 | 4.41 |
| 44754.395833333336 | 4.41 |
| 44754.40625 | 4.41 |
| 44754.416666666664 | 4.42 |
| 44754.427083333336 | 4.45 |
| 44754.4375 | 4.5 |
| 44754.447916666664 | 4.53 |
| 44754.458333333336 | 4.57 |
| 44754.46875 | 4.59 |
| 44754.479166666664 | 4.62 |
| 44754.489583333336 | 4.63 |
| 44754.5 | 4.64 |
| 44754.510416666664 | 4.55 |
| 44754.520833333336 | 4.53 |
| 44754.53125 | 4.55 |
| 44754.541666666664 | 4.66 |
| 44754.552083333336 | 4.65 |
| 44754.5625 | 4.83 |
| 44754.572916666664 | 4.86 |
| 44754.583333333336 | 4.92 |
| 44754.59375 | 4.95 |
| 44754.604166666664 | 5.11 |
| 44754.614583333336 | 5.19 |
| 44754.625 | 5.18 |
| 44754.635416666664 | 5.37 |
| 44754.645833333336 | 5.51 |
| 44754.65625 | 5.55 |
| 44754.666666666664 | 5.59 |
| 44754.677083333336 | 5.59 |
| 44754.6875 | 5.48 |
| 44754.697916666664 | 5.44 |
| 44754.708333333336 | 5.43 |
| 44754.71875 | 5.44 |
| 44754.729166666664 | 5.48 |
| 44754.739583333336 | 5.56 |
| 44754.75 | 5.61 |
| 44754.760416666664 | 5.51 |
| 44754.770833333336 | 5.38 |
| 44754.78125 | 5.2 |
| 44754.791666666664 | 5.13 |
| 44754.802083333336 | 5.27 |
| 44754.8125 | 5.4 |
| 44754.822916666664 | 5.54 |
| 44754.833333333336 | 5.58 |
| 44754.84375 | 5.56 |
| 44754.854166666664 | 5.57 |
| 44754.864583333336 | 5.66 |
| 44754.875 | 5.67 |
| 44754.885416666664 | 5.66 |
| 44754.895833333336 | 5.68 |
| 44754.90625 | 5.73 |
| 44754.916666666664 | 5.82 |
| 44754.927083333336 | 5.8 |
| 44754.9375 | 5.81 |
| 44754.947916666664 | 5.88 |
| 44754.958333333336 | 5.82 |
| 44754.96875 | 5.77 |
| 44754.979166666664 | 5.72 |
| 44754.989583333336 | 5.68 |
| 44755.0 | 5.66 |
| 44755.010416666664 | 5.71 |
| 44755.020833333336 | 5.63 |
| 44755.03125 | 5.6 |
| 44755.041666666664 | 5.31 |
| 44755.052083333336 | 5.42 |
| 44755.0625 | 5.38 |
| 44755.072916666664 | 5.23 |
| 44755.083333333336 | 5.11 |
| 44755.09375 | 5.16 |
| 44755.104166666664 | 5.05 |
| 44755.114583333336 | 4.84 |
| 44755.125 | 4.75 |
| 44755.135416666664 | 4.61 |
| 44755.145833333336 | 4.33 |
| 44755.15625 | 3.93 |
| 44755.166666666664 | 3.9 |
| 44755.177083333336 | 3.94 |
| 44755.1875 | 4 |
| 44755.197916666664 | 4.11 |
| 44755.208333333336 | 4.16 |
| 44755.21875 | 4.08 |
| 44755.229166666664 | 3.89 |
| 44755.239583333336 | 3.74 |
| 44755.25 | 3.5 |
| 44755.260416666664 | 3.31 |
| 44755.270833333336 | 3.15 |
| 44755.28125 | 3.08 |
| 44755.291666666664 | 3.01 |
| 44755.302083333336 | 2.95 |
| 44755.3125 | 2.91 |
| 44755.322916666664 | 2.95 |
| 44755.333333333336 | 2.91 |
| 44755.34375 | 3 |
| 44755.354166666664 | 3.14 |
| 44755.364583333336 | 3.19 |
| 44755.375 | 3.27 |
| 44755.385416666664 | 3.32 |
| 44755.395833333336 | 3.35 |
| 44755.40625 | 3.37 |
| 44755.416666666664 | 3.43 |
| 44755.427083333336 | 3.5 |
| 44755.4375 | 3.56 |
| 44755.447916666664 | 3.66 |
| 44755.458333333336 | 3.69 |
| 44755.46875 | 3.82 |
| 44755.479166666664 | 3.92 |
| 44755.489583333336 | 4.02 |
| 44755.5 | 4.11 |
| 44755.510416666664 | 4.13 |
| 44755.520833333336 | 4.2 |
| 44755.53125 | 4.17 |
| 44755.541666666664 | 4.03 |
| 44755.552083333336 | 4.14 |
| 44755.5625 | 4.17 |
| 44755.572916666664 | 4.15 |
| 44755.583333333336 | 4.24 |
| 44755.59375 | 4.33 |
| 44755.604166666664 | 4.41 |
| 44755.614583333336 | 4.47 |
| 44755.625 | 4.52 |
| 44755.635416666664 | 4.56 |
| 44755.645833333336 | 4.66 |
| 44755.65625 | 4.68 |
| 44755.666666666664 | 4.74 |
| 44755.677083333336 | 4.89 |
| 44755.6875 | 5.02 |
| 44755.697916666664 | 5.07 |
| 44755.708333333336 | 5.12 |
| 44755.71875 | 5.09 |
| 44755.729166666664 | 5.08 |
| 44755.739583333336 | 5.08 |
| 44755.75 | 5.12 |
| 44755.760416666664 | 5.14 |
| 44755.770833333336 | 4.89 |
| 44755.78125 | 5.21 |
| 44755.791666666664 | 5 |
| 44755.802083333336 | 5.08 |
| 44755.8125 | 4.99 |
| 44755.822916666664 | 4.78 |
| 44755.833333333336 | 4.62 |
| 44755.84375 | 4.73 |
| 44755.854166666664 | 4.76 |
| 44755.864583333336 | 4.75 |
| 44755.875 | 4.77 |
| 44755.885416666664 | 4.75 |
| 44755.895833333336 | 4.66 |
| 44755.90625 | 4.6 |
| 44755.916666666664 | 4.63 |
| 44755.927083333336 | 4.77 |
| 44755.9375 | 4.85 |
| 44755.947916666664 | 4.96 |
| 44755.958333333336 | 5.06 |
| 44755.96875 | 5.07 |
| 44755.979166666664 | 5.11 |
| 44755.989583333336 | 5.1 |
| 44756.0 | 5.07 |
| 44756.010416666664 | 5.04 |
| 44756.020833333336 | 5.02 |
| 44756.03125 | 4.98 |
| 44756.041666666664 | 5.02 |
| 44756.052083333336 | 4.99 |
| 44756.0625 | 4.98 |
| 44756.072916666664 | 4.98 |
| 44756.083333333336 | 4.87 |
| 44756.09375 | 4.8 |
| 44756.104166666664 | 4.84 |
| 44756.114583333336 | 4.63 |
| 44756.125 | 4.61 |
| 44756.135416666664 | 4.45 |
| 44756.145833333336 | 4.29 |
| 44756.15625 | 4.17 |
| 44756.166666666664 | 4.08 |
| 44756.177083333336 | 4.06 |
| 44756.1875 | 3.93 |
| 44756.197916666664 | 3.82 |
| 44756.208333333336 | 3.84 |
| 44756.21875 | 3.46 |
| 44756.229166666664 | 3.66 |
| 44756.239583333336 | 3.83 |
| 44756.25 | 3.88 |
| 44756.260416666664 | 3.83 |
| 44756.270833333336 | 3.74 |
| 44756.28125 | 3.67 |
| 44756.291666666664 | 3.53 |
| 44756.302083333336 | 3.37 |
| 44756.3125 | 3.13 |
| 44756.322916666664 | 3.07 |
| 44756.333333333336 | 2.95 |
| 44756.34375 | 2.87 |
| 44756.354166666664 | 2.91 |
| 44756.364583333336 | 2.89 |
| 44756.375 | 2.96 |
| 44756.385416666664 | 3.02 |
| 44756.395833333336 | 3.17 |
| 44756.40625 | 3.31 |
| 44756.416666666664 | 3.45 |
| 44756.427083333336 | 3.49 |
| 44756.4375 | 3.58 |
| 44756.447916666664 | 3.68 |
| 44756.458333333336 | 3.79 |
| 44756.46875 | 3.85 |
| 44756.479166666664 | 3.9 |
| 44756.489583333336 | 3.98 |
| 44756.5 | 4.13 |
| 44756.510416666664 | 4.27 |
| 44756.520833333336 | 4.34 |
| 44756.53125 | 4.38 |
| 44756.541666666664 | 4.46 |
| 44756.552083333336 | 4.47 |
| 44756.5625 | 4.49 |
| 44756.572916666664 | 4.48 |
| 44756.583333333336 | 4.27 |
| 44756.59375 | 4.31 |
| 44756.604166666664 | 4.39 |
| 44756.614583333336 | 4.49 |
| 44756.625 | 4.48 |
| 44756.635416666664 | 4.6 |
| 44756.645833333336 | 4.68 |
| 44756.65625 | 4.78 |
| 44756.666666666664 | 4.84 |
| 44756.677083333336 | 4.94 |
| 44756.6875 | 5.04 |
| 44756.697916666664 | 5.03 |
| 44756.708333333336 | 5.05 |
| 44756.71875 | 5.19 |
| 44756.729166666664 | 5.36 |
| 44756.739583333336 | 5.44 |
| 44756.75 | 5.49 |
| 44756.760416666664 | 5.55 |
| 44756.770833333336 | 5.58 |
| 44756.78125 | 5.61 |
| 44756.791666666664 | 5.58 |
| 44756.802083333336 | 5.77 |
| 44756.8125 | 5.77 |
| 44756.822916666664 | 5.6 |
| 44756.833333333336 | 5.99 |
| 44756.84375 | 5.74 |
| 44756.854166666664 | 5.75 |
| 44756.864583333336 | 5.7 |
| 44756.875 | 5.44 |
| 44756.885416666664 | 5.37 |
| 44756.895833333336 | 5.34 |
| 44756.90625 | 5.29 |
| 44756.916666666664 | 5.29 |
| 44756.927083333336 | 5.26 |
| 44756.9375 | 5.13 |
| 44756.947916666664 | 5.04 |
| 44756.958333333336 | 5.08 |
| 44756.96875 | 5.1 |
| 44756.979166666664 | 5.12 |
| 44756.989583333336 | 5.1 |
| 44757.0 | 5.1 |
| 44757.010416666664 | 5.11 |
| 44757.020833333336 | 5.11 |
| 44757.03125 | 5.11 |
| 44757.041666666664 | 5.08 |
| 44757.052083333336 | 5.06 |
| 44757.0625 | 5.04 |
| 44757.072916666664 | 5.01 |
| 44757.083333333336 | 4.99 |
| 44757.09375 | 4.97 |
| 44757.104166666664 | 4.96 |
| 44757.114583333336 | 4.78 |
| 44757.125 | 4.69 |
| 44757.135416666664 | 4.74 |
| 44757.145833333336 | 4.76 |
| 44757.15625 | 4.6 |
| 44757.166666666664 | 4.45 |
| 44757.177083333336 | 4.44 |
| 44757.1875 | 4.24 |
| 44757.197916666664 | 4.17 |
| 44757.208333333336 | 3.85 |
| 44757.21875 | 3.7 |
| 44757.229166666664 | 3.53 |
| 44757.239583333336 | 3.44 |
| 44757.25 | 3.33 |
| 44757.260416666664 | 3.22 |
| 44757.270833333336 | 3.12 |
| 44757.28125 | 3.5 |
| 44757.291666666664 | 3.66 |
| 44757.302083333336 | 3.61 |
| 44757.3125 | 3.58 |
| 44757.322916666664 | 3.48 |
| 44757.333333333336 | 3.33 |
| 44757.34375 | 3.23 |
| 44757.354166666664 | 3.02 |
| 44757.364583333336 | 2.96 |
| 44757.375 | 2.89 |
| 44757.385416666664 | 2.9 |
| 44757.395833333336 | 2.89 |
| 44757.40625 | 2.98 |
| 44757.416666666664 | 3.03 |
| 44757.427083333336 | 3.12 |
| 44757.4375 | 3.2 |
| 44757.447916666664 | 3.24 |
| 44757.458333333336 | 3.33 |
| 44757.46875 | 3.39 |
| 44757.479166666664 | 3.43 |
| 44757.489583333336 | 3.44 |
| 44757.5 | 3.54 |
| 44757.510416666664 | 3.63 |
| 44757.520833333336 | 3.66 |
| 44757.53125 | 3.78 |
| 44757.541666666664 | 3.91 |
| 44757.552083333336 | 3.99 |
| 44757.5625 | 4.08 |
| 44757.572916666664 | 4.11 |
| 44757.583333333336 | 4.08 |
| 44757.59375 | 4.18 |
| 44757.604166666664 | 4.15 |
| 44757.614583333336 | 4.08 |
| 44757.625 | 3.97 |
| 44757.635416666664 | 3.95 |
| 44757.645833333336 | 4.2 |
| 44757.65625 | 4.5 |
| 44757.666666666664 | 4.47 |
| 44757.677083333336 | 4.73 |
| 44757.6875 | 4.74 |
| 44757.697916666664 | 4.85 |
| 44757.708333333336 | 4.85 |
| 44757.71875 | 4.73 |
| 44757.729166666664 | 4.76 |
| 44757.739583333336 | 4.88 |
| 44757.75 | 4.9 |
| 44757.760416666664 | 4.94 |
| 44757.770833333336 | 5.07 |
| 44757.78125 | 5.18 |
| 44757.791666666664 | 5.21 |
| 44757.802083333336 | 5.2 |
| 44757.8125 | 5.1 |
| 44757.822916666664 | 4.98 |
| 44757.833333333336 | 4.92 |
| 44757.84375 | 4.84 |
| 44757.854166666664 | 4.78 |
| 44757.864583333336 | 4.76 |
| 44757.875 | 4.74 |
| 44757.885416666664 | 4.84 |
| 44757.895833333336 | 4.74 |
| 44757.90625 | 4.67 |
| 44757.916666666664 | 4.73 |
| 44757.927083333336 | 4.71 |
| 44757.9375 | 4.69 |
| 44757.947916666664 | 4.72 |
| 44757.958333333336 | 4.72 |
| 44757.96875 | 4.69 |
| 44757.979166666664 | 4.67 |
| 44757.989583333336 | 4.66 |
| 44758.0 | 4.6 |
| 44758.010416666664 | 4.57 |
| 44758.020833333336 | 4.69 |
| 44758.03125 | 4.64 |
| 44758.041666666664 | 4.66 |
| 44758.052083333336 | 4.64 |
| 44758.0625 | 4.66 |
| 44758.072916666664 | 4.62 |
| 44758.083333333336 | 4.6 |
| 44758.09375 | 4.56 |
| 44758.104166666664 | 4.53 |
| 44758.114583333336 | 4.48 |
| 44758.125 | 4.49 |
| 44758.135416666664 | 4.58 |
| 44758.145833333336 | 4.49 |
| 44758.15625 | 4.31 |
| 44758.166666666664 | 4.34 |
| 44758.177083333336 | 4.31 |
| 44758.1875 | 4.29 |
| 44758.197916666664 | 4.2 |
| 44758.208333333336 | 4.07 |
| 44758.21875 | 3.91 |
| 44758.229166666664 | 3.73 |
| 44758.239583333336 | 3.73 |
| 44758.25 | 3.55 |
| 44758.260416666664 | 3.41 |
| 44758.270833333336 | 3.23 |
| 44758.28125 | 3.17 |
| 44758.291666666664 | 3.24 |
| 44758.302083333336 | 3.27 |
| 44758.3125 | 3.23 |
| 44758.322916666664 | 3.32 |
| 44758.333333333336 | 3.37 |
| 44758.34375 | 3.22 |
| 44758.354166666664 | 3.13 |
| 44758.364583333336 | 3.02 |
| 44758.375 | 2.85 |
| 44758.385416666664 | 2.77 |
| 44758.395833333336 | 2.68 |
| 44758.40625 | 2.61 |
| 44758.416666666664 | 2.57 |
| 44758.427083333336 | 2.51 |
| 44758.4375 | 2.51 |
| 44758.447916666664 | 2.59 |
| 44758.458333333336 | 2.65 |
| 44758.46875 | 2.81 |
| 44758.479166666664 | 2.94 |
| 44758.489583333336 | 3.07 |
| 44758.5 | 3.17 |
| 44758.510416666664 | 3.24 |
| 44758.520833333336 | 3.26 |
| 44758.53125 | 3.31 |
| 44758.541666666664 | 3.34 |
| 44758.552083333336 | 3.39 |
| 44758.5625 | 3.53 |
| 44758.572916666664 | 3.64 |
| 44758.583333333336 | 3.78 |
| 44758.59375 | 3.81 |
| 44758.604166666664 | 3.92 |
| 44758.614583333336 | 4.04 |
| 44758.625 | 4.05 |
| 44758.635416666664 | 4.07 |
| 44758.645833333336 | 4.11 |
| 44758.65625 | 3.92 |
| 44758.666666666664 | 3.87 |
| 44758.677083333336 | 4.19 |
| 44758.6875 | 4.67 |
| 44758.697916666664 | 4.94 |
| 44758.708333333336 | 4.99 |
| 44758.71875 | 5.15 |
| 44758.729166666664 | 5.15 |
| 44758.739583333336 | 5.17 |
| 44758.75 | 5.28 |
| 44758.760416666664 | 5.59 |
| 44758.770833333336 | 5.68 |
| 44758.78125 | 5.73 |
| 44758.791666666664 | 5.53 |
| 44758.802083333336 | 5.46 |
| 44758.8125 | 5.48 |
| 44758.822916666664 | 5.53 |
| 44758.833333333336 | 5.59 |
| 44758.84375 | 5.63 |
| 44758.854166666664 | 5.77 |
| 44758.864583333336 | 5.73 |
| 44758.875 | 5.83 |
| 44758.885416666664 | 5.91 |
| 44758.895833333336 | 5.89 |
| 44758.90625 | 5.97 |
| 44758.916666666664 | 5.93 |
| 44758.927083333336 | 5.7 |
| 44758.9375 | 5.51 |
| 44758.947916666664 | 5.35 |
| 44758.958333333336 | 5.26 |
| 44758.96875 | 5.32 |
| 44758.979166666664 | 5.26 |
| 44758.989583333336 | 5.23 |
| 44759.0 | 5.2 |
| 44759.010416666664 | 5.2 |
| 44759.020833333336 | 5.14 |
| 44759.03125 | 5.04 |
| 44759.041666666664 | 5.07 |
| 44759.052083333336 | 5.1 |
| 44759.0625 | 5.17 |
| 44759.072916666664 | 5.1 |
| 44759.083333333336 | 5.05 |
| 44759.09375 | 5.03 |
| 44759.104166666664 | 5.01 |
| 44759.114583333336 | 5 |
| 44759.125 | 5.01 |
| 44759.135416666664 | 4.99 |
| 44759.145833333336 | 4.98 |
| 44759.15625 | 4.94 |
| 44759.166666666664 | 4.88 |
| 44759.177083333336 | 4.84 |
| 44759.1875 | 4.57 |
| 44759.197916666664 | 4.7 |
| 44759.208333333336 | 4.69 |
| 44759.21875 | 4.54 |
| 44759.229166666664 | 4.42 |
| 44759.239583333336 | 4.38 |
| 44759.25 | 4.25 |
| 44759.260416666664 | 4.3 |
| 44759.270833333336 | 4.21 |
| 44759.28125 | 4.16 |
| 44759.291666666664 | 3.91 |
| 44759.302083333336 | 3.67 |
| 44759.3125 | 3.53 |
| 44759.322916666664 | 3.3 |
| 44759.333333333336 | 3.35 |
| 44759.34375 | 3.44 |
| 44759.354166666664 | 3.29 |
| 44759.364583333336 | 3.6 |
| 44759.375 | 3.55 |
| 44759.385416666664 | 3.52 |
| 44759.395833333336 | 3.34 |
| 44759.40625 | 3.22 |
| 44759.416666666664 | 3.12 |
| 44759.427083333336 | 3.04 |
| 44759.4375 | 2.98 |
| 44759.447916666664 | 2.98 |
| 44759.458333333336 | 2.93 |
| 44759.46875 | 2.88 |
| 44759.479166666664 | 2.96 |
| 44759.489583333336 | 2.99 |
| 44759.5 | 3.11 |
| 44759.510416666664 | 3.13 |
| 44759.520833333336 | 3.2 |
| 44759.53125 | 3.31 |
| 44759.541666666664 | 3.42 |
| 44759.552083333336 | 3.48 |
| 44759.5625 | 3.56 |
| 44759.572916666664 | 3.68 |
| 44759.583333333336 | 3.75 |
| 44759.59375 | 3.82 |
| 44759.604166666664 | 3.99 |
| 44759.614583333336 | 4.19 |
| 44759.625 | 4.41 |
| 44759.635416666664 | 4.52 |
| 44759.645833333336 | 4.5 |
| 44759.65625 | 4.55 |
| 44759.666666666664 | 4.57 |
| 44759.677083333336 | 4.64 |
| 44759.6875 | 4.68 |
| 44759.697916666664 | 4.66 |
| 44759.708333333336 | 4.41 |
| 44759.71875 | 4.72 |
| 44759.729166666664 | 5.31 |
| 44759.739583333336 | 5.31 |
| 44759.75 | 5.59 |
| 44759.760416666664 | 5.81 |
| 44759.770833333336 | 5.92 |
| 44759.78125 | 6.1 |
| 44759.791666666664 | 6.02 |
| 44759.802083333336 | 6.2 |
| 44759.8125 | 6.43 |
| 44759.822916666664 | 6.33 |
| 44759.833333333336 | 6.23 |
| 44759.84375 | 6.26 |
| 44759.854166666664 | 6.33 |
| 44759.864583333336 | 6.32 |
| 44759.875 | 6.29 |
| 44759.885416666664 | 6.36 |
| 44759.895833333336 | 6.4 |
| 44759.90625 | 6.45 |
| 44759.916666666664 | 6.47 |
| 44759.927083333336 | 6.53 |
| 44759.9375 | 6.57 |
| 44759.947916666664 | 6.55 |
| 44759.958333333336 | 6.27 |
| 44759.96875 | 6.11 |
| 44759.979166666664 | 5.92 |
| 44759.989583333336 | 5.76 |
| 44760.0 | 5.72 |
| 44760.010416666664 | 5.64 |
| 44760.020833333336 | 5.53 |
| 44760.03125 | 5.47 |
| 44760.041666666664 | 5.45 |
| 44760.052083333336 | 5.4 |
| 44760.0625 | 5.38 |
| 44760.072916666664 | 5.38 |
| 44760.083333333336 | 5.37 |
| 44760.09375 | 5.35 |
| 44760.104166666664 | 5.34 |
| 44760.114583333336 | 5.3 |
| 44760.125 | 5.26 |
| 44760.135416666664 | 5.19 |
| 44760.145833333336 | 5.16 |
| 44760.15625 | 5.13 |
| 44760.166666666664 | 5.09 |
| 44760.177083333336 | 5.07 |
| 44760.1875 | 5.02 |
| 44760.197916666664 | 5.04 |
| 44760.208333333336 | 4.97 |
| 44760.21875 | 4.91 |
| 44760.229166666664 | 4.83 |
| 44760.239583333336 | 4.88 |
| 44760.25 | 4.79 |
| 44760.260416666664 | 4.71 |
| 44760.270833333336 | 4.62 |
| 44760.28125 | 4.43 |
| 44760.291666666664 | 4.31 |
| 44760.302083333336 | 4.14 |
| 44760.3125 | 4.04 |
| 44760.322916666664 | 3.77 |
| 44760.333333333336 | 3.68 |
| 44760.34375 | 4.15 |
| 44760.354166666664 | 4.07 |
| 44760.364583333336 | 4.17 |
| 44760.375 | 4.23 |
| 44760.385416666664 | 4.12 |
| 44760.395833333336 | 4.09 |
| 44760.40625 | 3.96 |
| 44760.416666666664 | 3.92 |
| 44760.427083333336 | 3.85 |
| 44760.4375 | 3.8 |
| 44760.447916666664 | 3.73 |
| 44760.458333333336 | 3.68 |
| 44760.46875 | 3.65 |
| 44760.479166666664 | 3.69 |
| 44760.489583333336 | 3.59 |
| 44760.5 | 3.5 |
| 44760.510416666664 | 3.53 |
| 44760.520833333336 | 3.53 |
| 44760.53125 | 3.75 |
| 44760.541666666664 | 3.9 |
| 44760.552083333336 | 4.17 |
| 44760.5625 | 4.29 |
| 44760.572916666664 | 4.37 |
| 44760.583333333336 | 4.45 |
| 44760.59375 | 4.55 |
| 44760.604166666664 | 4.66 |
| 44760.614583333336 | 4.8 |
| 44760.625 | 4.91 |
| 44760.635416666664 | 4.98 |
| 44760.645833333336 | 5.09 |
| 44760.65625 | 5.15 |
| 44760.666666666664 | 5.2 |
| 44760.677083333336 | 5.26 |
| 44760.6875 | 5.35 |
| 44760.697916666664 | 5.33 |
| 44760.708333333336 | 5.39 |
| 44760.71875 | 5.44 |
| 44760.729166666664 | 5.44 |
| 44760.739583333336 | 5.49 |
| 44760.75 | 5.35 |
| 44760.760416666664 | 5.76 |
| 44760.770833333336 | 5.89 |
| 44760.78125 | 6.32 |
| 44760.791666666664 | 6.6 |
| 44760.802083333336 | 6.81 |
| 44760.8125 | 6.75 |
| 44760.822916666664 | 6.7 |
| 44760.833333333336 | 6.73 |
| 44760.84375 | 6.79 |
| 44760.854166666664 | 6.79 |
| 44760.864583333336 | 6.68 |
| 44760.875 | 6.69 |
| 44760.885416666664 | 6.77 |
| 44760.895833333336 | 6.75 |
| 44760.90625 | 6.81 |
| 44760.916666666664 | 6.77 |
| 44760.927083333336 | 6.71 |
| 44760.9375 | 6.67 |
| 44760.947916666664 | 6.68 |
| 44760.958333333336 | 6.65 |
| 44760.96875 | 6.6 |
| 44760.979166666664 | 6.57 |
| 44760.989583333336 | 6.53 |
| 44761.0 | 6.26 |
| 44761.010416666664 | 6.12 |
| 44761.020833333336 | 5.93 |
| 44761.03125 | 5.85 |
| 44761.041666666664 | 5.84 |
| 44761.052083333336 | 5.75 |
| 44761.0625 | 5.62 |
| 44761.072916666664 | 5.56 |
| 44761.083333333336 | 5.52 |
| 44761.09375 | 5.46 |
| 44761.104166666664 | 5.41 |
| 44761.114583333336 | 5.38 |
| 44761.125 | 5.36 |
| 44761.135416666664 | 5.33 |
| 44761.145833333336 | 5.32 |
| 44761.15625 | 5.33 |
| 44761.166666666664 | 5.31 |
| 44761.177083333336 | 5.3 |
| 44761.1875 | 5.27 |
| 44761.197916666664 | 5.25 |
| 44761.208333333336 | 5.25 |
| 44761.21875 | 5.18 |
| 44761.229166666664 | 5.14 |
| 44761.239583333336 | 5.14 |
| 44761.25 | 5.14 |
| 44761.260416666664 | 4.79 |
| 44761.270833333336 | 4.89 |
| 44761.28125 | 5.04 |
| 44761.291666666664 | 5.1 |
| 44761.302083333336 | 5.09 |
| 44761.3125 | 4.51 |
| 44761.322916666664 | 4.39 |
| 44761.333333333336 | 4.35 |
| 44761.34375 | 4.21 |
| 44761.354166666664 | 3.96 |
| 44761.364583333336 | 4.31 |
| 44761.375 | 4.22 |
| 44761.385416666664 | 4.18 |
| 44761.395833333336 | 4.18 |
| 44761.40625 | 4.01 |
| 44761.416666666664 | 4.01 |
| 44761.427083333336 | 3.95 |
| 44761.4375 | 3.92 |
| 44761.447916666664 | 3.86 |
| 44761.458333333336 | 3.82 |
| 44761.46875 | 3.75 |
| 44761.479166666664 | 3.73 |
| 44761.489583333336 | 3.77 |
| 44761.5 | 3.62 |
| 44761.510416666664 | 3.74 |
| 44761.520833333336 | 3.66 |
| 44761.53125 | 3.59 |
| 44761.541666666664 | 3.47 |
| 44761.552083333336 | 3.52 |
| 44761.5625 | 3.62 |
| 44761.572916666664 | 3.74 |
| 44761.583333333336 | 3.88 |
| 44761.59375 | 3.97 |
| 44761.604166666664 | 4.09 |
| 44761.614583333336 | 4.16 |
| 44761.625 | 4.34 |
| 44761.635416666664 | 4.43 |
| 44761.645833333336 | 4.55 |
| 44761.65625 | 4.71 |
| 44761.666666666664 | 4.9 |
| 44761.677083333336 | 5.05 |
| 44761.6875 | 5.18 |
| 44761.697916666664 | 5.23 |
| 44761.708333333336 | 5.27 |
| 44761.71875 | 5.29 |
| 44761.729166666664 | 5.34 |
| 44761.739583333336 | 5.37 |
| 44761.75 | 5.41 |
| 44761.760416666664 | 5.4 |
| 44761.770833333336 | 5.39 |
| 44761.78125 | 5.09 |
| 44761.791666666664 | 5.77 |
| 44761.802083333336 | 6.16 |
| 44761.8125 | 6.09 |
| 44761.822916666664 | 6.31 |
| 44761.833333333336 | 6.39 |
| 44761.84375 | 6.42 |
| 44761.854166666664 | 6.53 |
| 44761.864583333336 | 6.5 |
| 44761.875 | 6.7 |
| 44761.885416666664 | 6.7 |
| 44761.895833333336 | 6.75 |
| 44761.90625 | 6.63 |
| 44761.916666666664 | 6.83 |
| 44761.927083333336 | 7 |
| 44761.9375 | 7.18 |
| 44761.947916666664 | 7.22 |
| 44761.958333333336 | 7.59 |
| 44761.96875 | 7.82 |
| 44761.979166666664 | 8.14 |
| 44761.989583333336 | 8.24 |
| 44762.0 | 8.21 |
| 44762.010416666664 | 8.25 |
| 44762.020833333336 | 8.17 |
| 44762.03125 | 7.89 |
| 44762.041666666664 | 7.87 |
| 44762.052083333336 | 7.6 |
| 44762.0625 | 7.51 |
| 44762.072916666664 | 7.41 |
| 44762.083333333336 | 7.17 |
| 44762.09375 | 6.95 |
| 44762.104166666664 | 6.55 |
| 44762.114583333336 | 6.19 |
| 44762.125 | 5.87 |
| 44762.135416666664 | 5.73 |
| 44762.145833333336 | 5.59 |
| 44762.15625 | 5.46 |
| 44762.166666666664 | 5.35 |
| 44762.177083333336 | 5.24 |
| 44762.1875 | 5.15 |
| 44762.197916666664 | 5.09 |
| 44762.208333333336 | 5.01 |
| 44762.21875 | 4.95 |
| 44762.229166666664 | 4.89 |
| 44762.239583333336 | 4.83 |
| 44762.25 | 4.81 |
| 44762.260416666664 | 4.8 |
| 44762.270833333336 | 4.78 |
| 44762.28125 | 4.69 |
| 44762.291666666664 | 4.23 |
| 44762.302083333336 | 4.4 |
| 44762.3125 | 4.49 |
| 44762.322916666664 | 4.3 |
| 44762.333333333336 | 3.97 |
| 44762.34375 | 4.01 |
| 44762.354166666664 | 3.84 |
| 44762.364583333336 | 3.81 |
| 44762.375 | 3.77 |
| 44762.385416666664 | 3.61 |
| 44762.395833333336 | 3.71 |
| 44762.40625 | 4.09 |
| 44762.416666666664 | 3.85 |
| 44762.427083333336 | 4.16 |
| 44762.4375 | 4.17 |
| 44762.447916666664 | 4.17 |
| 44762.458333333336 | 4.14 |
| 44762.46875 | 4.1 |
| 44762.479166666664 | 4.09 |
| 44762.489583333336 | 4.08 |
| 44762.5 | 4.01 |
| 44762.510416666664 | 4.03 |
| 44762.520833333336 | 4.05 |
| 44762.53125 | 4 |
| 44762.541666666664 | 4.04 |
| 44762.552083333336 | 3.91 |
| 44762.5625 | 3.87 |
| 44762.572916666664 | 3.77 |
| 44762.583333333336 | 3.78 |
| 44762.59375 | 3.85 |
| 44762.604166666664 | 3.92 |
| 44762.614583333336 | 3.92 |
| 44762.625 | 4.14 |
| 44762.635416666664 | 4.2 |
| 44762.645833333336 | 4.28 |
| 44762.65625 | 4.45 |
| 44762.666666666664 | 4.48 |
| 44762.677083333336 | 4.55 |
| 44762.6875 | 4.64 |
| 44762.697916666664 | 4.7 |
| 44762.708333333336 | 4.75 |
| 44762.71875 | 5 |
| 44762.729166666664 | 5.04 |
| 44762.739583333336 | 5.29 |
| 44762.75 | 5.31 |
| 44762.760416666664 | 5.33 |
| 44762.770833333336 | 5.51 |
| 44762.78125 | 5.44 |
| 44762.791666666664 | 5.5 |
| 44762.802083333336 | 5.64 |
| 44762.8125 | 5.73 |
| 44762.822916666664 | 5.32 |
| 44762.833333333336 | 5.74 |
| 44762.84375 | 6.16 |
| 44762.854166666664 | 6.57 |
| 44762.864583333336 | 6.56 |
| 44762.875 | 6.76 |
| 44762.885416666664 | 6.58 |
| 44762.895833333336 | 6.44 |
| 44762.90625 | 6.49 |
| 44762.916666666664 | 6.43 |
| 44762.927083333336 | 6.28 |
| 44762.9375 | 6.1 |
| 44762.947916666664 | 6.08 |
| 44762.958333333336 | 6.1 |
| 44762.96875 | 6.24 |
| 44762.979166666664 | 6.34 |
| 44762.989583333336 | 6.44 |
| 44763.0 | 6.48 |
| 44763.010416666664 | 6.45 |
| 44763.020833333336 | 6.44 |
| 44763.03125 | 6.45 |
| 44763.041666666664 | 6.44 |
| 44763.052083333336 | 6.43 |
| 44763.0625 | 6.27 |
| 44763.072916666664 | 6.32 |
| 44763.083333333336 | 5.97 |
| 44763.09375 | 5.81 |
| 44763.104166666664 | 5.8 |
| 44763.114583333336 | 5.69 |
| 44763.125 | 5.49 |
| 44763.135416666664 | 5.44 |
| 44763.145833333336 | 5.41 |
| 44763.15625 | 5.27 |
| 44763.166666666664 | 5.14 |
| 44763.177083333336 | 5.07 |
| 44763.1875 | 5.03 |
| 44763.197916666664 | 4.97 |
| 44763.208333333336 | 4.92 |
| 44763.21875 | 4.91 |
| 44763.229166666664 | 4.85 |
| 44763.239583333336 | 4.81 |
| 44763.25 | 4.79 |
| 44763.260416666664 | 4.78 |
| 44763.270833333336 | 4.75 |
| 44763.28125 | 4.73 |
| 44763.291666666664 | 4.69 |
| 44763.302083333336 | 4.65 |
| 44763.3125 | 4.58 |
| 44763.322916666664 | 4.23 |
| 44763.333333333336 | 4.29 |
| 44763.34375 | 4.39 |
| 44763.354166666664 | 4.28 |
| 44763.364583333336 | 4.21 |
| 44763.375 | 4.22 |
| 44763.385416666664 | 4.29 |
| 44763.395833333336 | 3.85 |
| 44763.40625 | 3.97 |
| 44763.416666666664 | 4.17 |
| 44763.427083333336 | 3.86 |
| 44763.4375 | 3.95 |
| 44763.447916666664 | 4.05 |
| 44763.458333333336 | 4.03 |
| 44763.46875 | 4 |
| 44763.479166666664 | 3.96 |
| 44763.489583333336 | 3.91 |
| 44763.5 | 3.9 |
| 44763.510416666664 | 3.91 |
| 44763.520833333336 | 3.93 |
| 44763.53125 | 3.99 |
| 44763.541666666664 | 4.07 |
| 44763.552083333336 | 4.15 |
| 44763.5625 | 4.2 |
| 44763.572916666664 | 4.05 |
| 44763.583333333336 | 4.04 |
| 44763.59375 | 3.91 |
| 44763.604166666664 | 3.75 |
| 44763.614583333336 | 3.74 |
| 44763.625 | 3.89 |
| 44763.635416666664 | 4.06 |
| 44763.645833333336 | 4.3 |
| 44763.65625 | 4.59 |
| 44763.666666666664 | 4.69 |
| 44763.677083333336 | 4.78 |
| 44763.6875 | 4.89 |
| 44763.697916666664 | 5.09 |
| 44763.708333333336 | 5.3 |
| 44763.71875 | 5.44 |
| 44763.729166666664 | 5.52 |
| 44763.739583333336 | 5.58 |
| 44763.75 | 5.66 |
| 44763.760416666664 | 5.78 |
| 44763.770833333336 | 5.82 |
| 44763.78125 | 5.95 |
| 44763.791666666664 | 5.89 |
| 44763.802083333336 | 5.93 |
| 44763.8125 | 5.94 |
| 44763.822916666664 | 5.97 |
| 44763.833333333336 | 5.93 |
| 44763.84375 | 5.84 |
| 44763.854166666664 | 5.9 |
| 44763.864583333336 | 6.13 |
| 44763.875 | 6.08 |
| 44763.885416666664 | 6.26 |
| 44763.895833333336 | 6.38 |
| 44763.90625 | 6.08 |
| 44763.916666666664 | 6.26 |
| 44763.927083333336 | 6.24 |
| 44763.9375 | 6 |
| 44763.947916666664 | 5.91 |
| 44763.958333333336 | 5.76 |
| 44763.96875 | 5.64 |
| 44763.979166666664 | 5.58 |
| 44763.989583333336 | 5.4 |
| 44764.0 | 5.48 |
| 44764.010416666664 | 5.78 |
| 44764.020833333336 | 6 |
| 44764.03125 | 5.96 |
| 44764.041666666664 | 5.88 |
| 44764.052083333336 | 5.87 |
| 44764.0625 | 5.78 |
| 44764.072916666664 | 5.78 |
| 44764.083333333336 | 5.76 |
| 44764.09375 | 5.76 |
| 44764.104166666664 | 5.69 |
| 44764.114583333336 | 5.53 |
| 44764.125 | 5.39 |
| 44764.135416666664 | 5.21 |
| 44764.145833333336 | 5.13 |
| 44764.15625 | 4.91 |
| 44764.166666666664 | 4.86 |
| 44764.177083333336 | 4.88 |
| 44764.1875 | 4.77 |
| 44764.197916666664 | 4.74 |
| 44764.208333333336 | 4.69 |
| 44764.21875 | 4.63 |
| 44764.229166666664 | 4.57 |
| 44764.239583333336 | 4.52 |
| 44764.25 | 4.49 |
| 44764.260416666664 | 4.42 |
| 44764.270833333336 | 4.37 |
| 44764.28125 | 4.4 |
| 44764.291666666664 | 4.45 |
| 44764.302083333336 | 4.42 |
| 44764.3125 | 4.41 |
| 44764.322916666664 | 4.39 |
| 44764.333333333336 | 4.32 |
| 44764.34375 | 4.16 |
| 44764.354166666664 | 3.71 |
| 44764.364583333336 | 3.32 |
| 44764.375 | 3.51 |
| 44764.385416666664 | 3.59 |
| 44764.395833333336 | 3.9 |
| 44764.40625 | 4.12 |
| 44764.416666666664 | 3.88 |
| 44764.427083333336 | 3.99 |
| 44764.4375 | 3.91 |
| 44764.447916666664 | 4.06 |
| 44764.458333333336 | 3.94 |
| 44764.46875 | 3.67 |
| 44764.479166666664 | 3.73 |
| 44764.489583333336 | 3.65 |
| 44764.5 | 3.52 |
| 44764.510416666664 | 3.48 |
| 44764.520833333336 | 3.44 |
| 44764.53125 | 3.4 |
| 44764.541666666664 | 3.37 |
| 44764.552083333336 | 3.37 |
| 44764.5625 | 3.49 |
| 44764.572916666664 | 3.41 |
| 44764.583333333336 | 3.51 |
| 44764.59375 | 3.56 |
| 44764.604166666664 | 3.7 |
| 44764.614583333336 | 3.67 |
| 44764.625 | 3.49 |
| 44764.635416666664 | 3.35 |
| 44764.645833333336 | 3.5 |
| 44764.65625 | 3.58 |
| 44764.666666666664 | 3.75 |
| 44764.677083333336 | 3.97 |
| 44764.6875 | 4.2 |
| 44764.697916666664 | 4.38 |
| 44764.708333333336 | 4.45 |
| 44764.71875 | 4.57 |
| 44764.729166666664 | 4.65 |
| 44764.739583333336 | 4.79 |
| 44764.75 | 4.89 |
| 44764.760416666664 | 5.04 |
| 44764.770833333336 | 5.13 |
| 44764.78125 | 5.17 |
| 44764.791666666664 | 5.28 |
| 44764.802083333336 | 5.33 |
| 44764.8125 | 5.34 |
| 44764.822916666664 | 5.39 |
| 44764.833333333336 | 5.39 |
| 44764.84375 | 5.41 |
| 44764.854166666664 | 5.4 |
| 44764.864583333336 | 5.42 |
| 44764.875 | 5.45 |
| 44764.885416666664 | 5.41 |
| 44764.895833333336 | 5.05 |
| 44764.90625 | 4.84 |
| 44764.916666666664 | 4.89 |
| 44764.927083333336 | 5.23 |
| 44764.9375 | 5.52 |
| 44764.947916666664 | 5.65 |
| 44764.958333333336 | 5.58 |
| 44764.96875 | 5.46 |
| 44764.979166666664 | 5.51 |
| 44764.989583333336 | 5.39 |
| 44765.0 | 5.23 |
| 44765.010416666664 | 4.82 |
| 44765.020833333336 | 4.9 |
| 44765.03125 | 4.8 |
| 44765.041666666664 | 5.02 |
| 44765.052083333336 | 5.42 |
| 44765.0625 | 5.58 |
| 44765.072916666664 | 5.69 |
| 44765.083333333336 | 5.76 |
| 44765.09375 | 5.79 |
| 44765.104166666664 | 5.8 |
| 44765.114583333336 | 5.79 |
| 44765.125 | 5.76 |
| 44765.135416666664 | 5.47 |
| 44765.145833333336 | 5.5 |
| 44765.15625 | 5.27 |
| 44765.166666666664 | 5.12 |
| 44765.177083333336 | 5.09 |
| 44765.1875 | 4.92 |
| 44765.197916666664 | 4.74 |
| 44765.208333333336 | 4.63 |
| 44765.21875 | 4.59 |
| 44765.229166666664 | 4.53 |
| 44765.239583333336 | 4.45 |
| 44765.25 | 4.44 |
| 44765.260416666664 | 4.35 |
| 44765.270833333336 | 4.26 |
| 44765.28125 | 4.23 |
| 44765.291666666664 | 4.16 |
| 44765.302083333336 | 4.11 |
| 44765.3125 | 4.07 |
| 44765.322916666664 | 4.03 |
| 44765.333333333336 | 4.01 |
| 44765.34375 | 3.97 |
| 44765.354166666664 | 3.96 |
| 44765.364583333336 | 3.92 |
| 44765.375 | 3.86 |
| 44765.385416666664 | 3.8 |
| 44765.395833333336 | 3.65 |
| 44765.40625 | 3.69 |
| 44765.416666666664 | 3.61 |
| 44765.427083333336 | 3.45 |
| 44765.4375 | 3.51 |
| 44765.447916666664 | 3.59 |
| 44765.458333333336 | 3.44 |
| 44765.46875 | 3.37 |
| 44765.479166666664 | 3.43 |
| 44765.489583333336 | 3.44 |
| 44765.5 | 3.34 |
| 44765.510416666664 | 3.38 |
| 44765.520833333336 | 3.4 |
| 44765.53125 | 3.56 |
| 44765.541666666664 | 3.61 |
| 44765.552083333336 | 3.77 |
| 44765.5625 | 3.6 |
| 44765.572916666664 | 3.65 |
| 44765.583333333336 | 3.65 |
| 44765.59375 | 3.78 |
| 44765.604166666664 | 3.97 |
| 44765.614583333336 | 4.1 |
| 44765.625 | 4.04 |
| 44765.635416666664 | 3.99 |
| 44765.645833333336 | 4.75 |
| 44765.65625 | 4.62 |
| 44765.666666666664 | 4.42 |
| 44765.677083333336 | 4.32 |
| 44765.6875 | 4.27 |
| 44765.697916666664 | 4.36 |
| 44765.708333333336 | 4.54 |
| 44765.71875 | 4.37 |
| 44765.729166666664 | 4.61 |
| 44765.739583333336 | 4.81 |
| 44765.75 | 4.9 |
| 44765.760416666664 | 4.9 |
| 44765.770833333336 | 4.95 |
| 44765.78125 | 4.89 |
| 44765.791666666664 | 4.86 |
| 44765.802083333336 | 4.95 |
| 44765.8125 | 5.01 |
| 44765.822916666664 | 5.06 |
| 44765.833333333336 | 5.17 |
| 44765.84375 | 5.29 |
| 44765.854166666664 | 5.39 |
| 44765.864583333336 | 5.46 |
| 44765.875 | 5.58 |
| 44765.885416666664 | 5.47 |
| 44765.895833333336 | 5.44 |
| 44765.90625 | 5.49 |
| 44765.916666666664 | 5.55 |
| 44765.927083333336 | 5.08 |
| 44765.9375 | 5.18 |
| 44765.947916666664 | 5.08 |
| 44765.958333333336 | 5.42 |
| 44765.96875 | 5.62 |
| 44765.979166666664 | 5.59 |
| 44765.989583333336 | 5.45 |
| 44766.0 | 5.35 |
| 44766.010416666664 | 5.26 |
| 44766.020833333336 | 5.1 |
| 44766.03125 | 4.85 |
| 44766.041666666664 | 4.78 |
| 44766.052083333336 | 4.4 |
| 44766.0625 | 4.59 |
| 44766.072916666664 | 4.85 |
| 44766.083333333336 | 5.01 |
| 44766.09375 | 4.96 |
| 44766.104166666664 | 5.17 |
| 44766.114583333336 | 5.14 |
| 44766.125 | 4.99 |
| 44766.135416666664 | 4.95 |
| 44766.145833333336 | 4.77 |
| 44766.15625 | 4.76 |
| 44766.166666666664 | 4.67 |
| 44766.177083333336 | 4.67 |
| 44766.1875 | 4.44 |
| 44766.197916666664 | 4.25 |
| 44766.208333333336 | 4.25 |
| 44766.21875 | 4.2 |
| 44766.229166666664 | 4.1 |
| 44766.239583333336 | 3.96 |
| 44766.25 | 3.97 |
| 44766.260416666664 | 4.01 |
| 44766.270833333336 | 3.99 |
| 44766.28125 | 3.96 |
| 44766.291666666664 | 3.94 |
| 44766.302083333336 | 3.89 |
| 44766.3125 | 3.87 |
| 44766.322916666664 | 3.86 |
| 44766.333333333336 | 3.84 |
| 44766.34375 | 3.8 |
| 44766.354166666664 | 3.85 |
| 44766.364583333336 | 3.88 |
| 44766.375 | 3.82 |
| 44766.385416666664 | 3.78 |
| 44766.395833333336 | 3.75 |
| 44766.40625 | 3.71 |
| 44766.416666666664 | 3.72 |
| 44766.427083333336 | 3.32 |
| 44766.4375 | 3.48 |
| 44766.447916666664 | 3.53 |
| 44766.458333333336 | 3.28 |
| 44766.46875 | 3.24 |
| 44766.479166666664 | 3.32 |
| 44766.489583333336 | 3.75 |
| 44766.5 | 3.76 |
| 44766.510416666664 | 3.69 |
| 44766.520833333336 | 3.78 |
| 44766.53125 | 3.66 |
| 44766.541666666664 | 3.59 |
| 44766.552083333336 | 3.66 |
| 44766.5625 | 3.63 |
| 44766.572916666664 | 3.7 |
| 44766.583333333336 | 3.78 |
| 44766.59375 | 3.88 |
| 44766.604166666664 | 4.02 |
| 44766.614583333336 | 4.13 |
| 44766.625 | 4.3 |
| 44766.635416666664 | 4.48 |
| 44766.645833333336 | 4.66 |
| 44766.65625 | 4.81 |
| 44766.666666666664 | 5.05 |
| 44766.677083333336 | 5.3 |
| 44766.6875 | 5.24 |
| 44766.697916666664 | 5.14 |
| 44766.708333333336 | 5.13 |
| 44766.71875 | 4.86 |
| 44766.729166666664 | 4.66 |
| 44766.739583333336 | 4.75 |
| 44766.75 | 4.91 |
| 44766.760416666664 | 4.96 |
| 44766.770833333336 | 5.1 |
| 44766.78125 | 5.26 |
| 44766.791666666664 | 5.37 |
| 44766.802083333336 | 5.62 |
| 44766.8125 | 5.72 |
| 44766.822916666664 | 5.74 |
| 44766.833333333336 | 5.78 |
| 44766.84375 | 5.74 |
| 44766.854166666664 | 5.73 |
| 44766.864583333336 | 5.72 |
| 44766.875 | 5.69 |
| 44766.885416666664 | 5.64 |
| 44766.895833333336 | 5.64 |
| 44766.90625 | 5.63 |
| 44766.916666666664 | 5.63 |
| 44766.927083333336 | 5.64 |
| 44766.9375 | 5.61 |
| 44766.947916666664 | 5.58 |
| 44766.958333333336 | 5.5 |
| 44766.96875 | 5.47 |
| 44766.979166666664 | 5.58 |
| 44766.989583333336 | 5.72 |
| 44767.0 | 5.49 |
| 44767.010416666664 | 5.49 |
| 44767.020833333336 | 5.23 |
| 44767.03125 | 5.15 |
| 44767.041666666664 | 5.1 |
| 44767.052083333336 | 4.98 |
| 44767.0625 | 4.99 |
| 44767.072916666664 | 4.94 |
| 44767.083333333336 | 4.85 |
| 44767.09375 | 4.94 |
| 44767.104166666664 | 4.92 |
| 44767.114583333336 | 4.92 |
| 44767.125 | 4.85 |
| 44767.135416666664 | 4.59 |
| 44767.145833333336 | 4.53 |
| 44767.15625 | 4.64 |
| 44767.166666666664 | 4.62 |
| 44767.177083333336 | 4.57 |
| 44767.1875 | 4.49 |
| 44767.197916666664 | 4.28 |
| 44767.208333333336 | 4.29 |
| 44767.21875 | 4.27 |
| 44767.229166666664 | 4.16 |
| 44767.239583333336 | 4.08 |
| 44767.25 | 3.98 |
| 44767.260416666664 | 3.87 |
| 44767.270833333336 | 3.74 |
| 44767.28125 | 3.78 |
| 44767.291666666664 | 3.86 |
| 44767.302083333336 | 3.95 |
| 44767.3125 | 4.02 |
| 44767.322916666664 | 4.14 |
| 44767.333333333336 | 4.21 |
| 44767.34375 | 4.31 |
| 44767.354166666664 | 4.39 |
| 44767.364583333336 | 4.48 |
| 44767.375 | 4.57 |
| 44767.385416666664 | 4.62 |
| 44767.395833333336 | 4.65 |
| 44767.40625 | 4.66 |
| 44767.416666666664 | 4.65 |
| 44767.427083333336 | 4.66 |
| 44767.4375 | 4.67 |
| 44767.447916666664 | 4.58 |
| 44767.458333333336 | 4.3 |
| 44767.46875 | 4.05 |
| 44767.479166666664 | 4.29 |
| 44767.489583333336 | 4.39 |
| 44767.5 | 4.89 |
| 44767.510416666664 | 4.91 |
| 44767.520833333336 | 4.86 |
| 44767.53125 | 4.9 |
| 44767.541666666664 | 4.85 |
| 44767.552083333336 | 4.87 |
| 44767.5625 | 4.83 |
| 44767.572916666664 | 4.87 |
| 44767.583333333336 | 4.98 |
| 44767.59375 | 4.82 |
| 44767.604166666664 | 4.71 |
| 44767.614583333336 | 4.65 |
| 44767.625 | 4.69 |
| 44767.635416666664 | 4.66 |
| 44767.645833333336 | 4.75 |
| 44767.65625 | 4.86 |
| 44767.666666666664 | 5 |
| 44767.677083333336 | 5.04 |
| 44767.6875 | 5.03 |
| 44767.697916666664 | 5.03 |
| 44767.708333333336 | 5.05 |
| 44767.71875 | 5.1 |
| 44767.729166666664 | 5.26 |
| 44767.739583333336 | 5 |
| 44767.75 | 4.96 |
| 44767.760416666664 | 4.74 |
| 44767.770833333336 | 4.64 |
| 44767.78125 | 4.9 |
| 44767.791666666664 | 5.11 |
| 44767.802083333336 | 5.19 |
| 44767.8125 | 5.25 |
| 44767.822916666664 | 5.41 |
| 44767.833333333336 | 5.47 |
| 44767.84375 | 5.4 |
| 44767.854166666664 | 5.42 |
| 44767.864583333336 | 5.53 |
| 44767.875 | 5.6 |
| 44767.885416666664 | 5.59 |
| 44767.895833333336 | 5.59 |
| 44767.90625 | 5.68 |
| 44767.916666666664 | 5.71 |
| 44767.927083333336 | 5.63 |
| 44767.9375 | 5.56 |
| 44767.947916666664 | 5.56 |
| 44767.958333333336 | 5.52 |
| 44767.96875 | 5.46 |
| 44767.979166666664 | 5.39 |
| 44767.989583333336 | 5.16 |
| 44768.0 | 4.85 |
| 44768.010416666664 | 5.26 |
| 44768.020833333336 | 5.19 |
| 44768.03125 | 4.69 |
| 44768.041666666664 | 4.87 |
| 44768.052083333336 | 4.92 |
| 44768.0625 | 4.5 |
| 44768.072916666664 | 4.44 |
| 44768.083333333336 | 4.18 |
| 44768.09375 | 4.32 |
| 44768.104166666664 | 4.08 |
| 44768.114583333336 | 4.06 |
| 44768.125 | 3.99 |
| 44768.135416666664 | 4.07 |
| 44768.145833333336 | 4.09 |
| 44768.15625 | 4.07 |
| 44768.166666666664 | 4.06 |
| 44768.177083333336 | 3.98 |
| 44768.1875 | 3.92 |
| 44768.197916666664 | 3.89 |
| 44768.208333333336 | 3.98 |
| 44768.21875 | 3.96 |
| 44768.229166666664 | 3.91 |
| 44768.239583333336 | 3.73 |
| 44768.25 | 3.79 |
| 44768.260416666664 | 3.6 |
| 44768.270833333336 | 3.51 |
| 44768.28125 | 3.53 |
| 44768.291666666664 | 3.46 |
| 44768.302083333336 | 3.35 |
| 44768.3125 | 3.22 |
| 44768.322916666664 | 3.23 |
| 44768.333333333336 | 3.33 |
| 44768.34375 | 3.49 |
| 44768.354166666664 | 3.59 |
| 44768.364583333336 | 3.66 |
| 44768.375 | 3.77 |
| 44768.385416666664 | 3.78 |
| 44768.395833333336 | 3.85 |
| 44768.40625 | 3.92 |
| 44768.416666666664 | 4.02 |
| 44768.427083333336 | 4.13 |
| 44768.4375 | 4.12 |
| 44768.447916666664 | 4.17 |
| 44768.458333333336 | 4.31 |
| 44768.46875 | 3.76 |
| 44768.479166666664 | 3.7 |
| 44768.489583333336 | 3.9 |
| 44768.5 | 4.34 |
| 44768.510416666664 | 4.4 |
| 44768.520833333336 | 4.14 |
| 44768.53125 | 4.56 |
| 44768.541666666664 | 4.18 |
| 44768.552083333336 | 4.56 |
| 44768.5625 | 4.42 |
| 44768.572916666664 | 4.25 |
| 44768.583333333336 | 4.17 |
| 44768.59375 | 3.93 |
| 44768.604166666664 | 4.06 |
| 44768.614583333336 | 3.85 |
| 44768.625 | 3.83 |
| 44768.635416666664 | 3.78 |
| 44768.645833333336 | 3.71 |
| 44768.65625 | 3.75 |
| 44768.666666666664 | 3.67 |
| 44768.677083333336 | 3.89 |
| 44768.6875 | 3.82 |
| 44768.697916666664 | 3.8 |
| 44768.708333333336 | 3.92 |
| 44768.71875 | 3.95 |
| 44768.729166666664 | 4.03 |
| 44768.739583333336 | 3.77 |
| 44768.75 | 3.78 |
| 44768.760416666664 | 3.59 |
| 44768.770833333336 | 3.42 |
| 44768.78125 | 3.53 |
| 44768.791666666664 | 3.52 |
| 44768.802083333336 | 3.66 |
| 44768.8125 | 3.94 |
| 44768.822916666664 | 4.25 |
| 44768.833333333336 | 4.38 |
| 44768.84375 | 4.46 |
| 44768.854166666664 | 4.45 |
| 44768.864583333336 | 4.56 |
| 44768.875 | 4.74 |
| 44768.885416666664 | 4.83 |
| 44768.895833333336 | 4.96 |
| 44768.90625 | 5.01 |
| 44768.916666666664 | 5.12 |
| 44768.927083333336 | 5.1 |
| 44768.9375 | 5.15 |
| 44768.947916666664 | 5.09 |
| 44768.958333333336 | 5.03 |
| 44768.96875 | 5.05 |
| 44768.979166666664 | 5.03 |
| 44768.989583333336 | 4.98 |
| 44769.0 | 4.97 |
| 44769.010416666664 | 4.87 |
| 44769.020833333336 | 4.88 |
| 44769.03125 | 4.79 |
| 44769.041666666664 | 4.52 |
| 44769.052083333336 | 4.49 |
| 44769.0625 | 4.44 |
| 44769.072916666664 | 4.65 |
| 44769.083333333336 | 4.66 |
| 44769.09375 | 4.14 |
| 44769.104166666664 | 4.23 |
| 44769.114583333336 | 4.02 |
| 44769.125 | 3.85 |
| 44769.135416666664 | 3.73 |
| 44769.145833333336 | 3.57 |
| 44769.15625 | 3.54 |
| 44769.166666666664 | 3.39 |
| 44769.177083333336 | 3.34 |
| 44769.1875 | 3.15 |
| 44769.197916666664 | 3.28 |
| 44769.208333333336 | 3.19 |
| 44769.21875 | 3.37 |
| 44769.229166666664 | 3.23 |
| 44769.239583333336 | 3.34 |
| 44769.25 | 3.39 |
| 44769.260416666664 | 3.37 |
| 44769.270833333336 | 3.03 |
| 44769.28125 | 3.12 |
| 44769.291666666664 | 3.09 |
| 44769.302083333336 | 3.04 |
| 44769.3125 | 2.97 |
| 44769.322916666664 | 2.92 |
| 44769.333333333336 | 2.85 |
| 44769.34375 | 2.83 |
| 44769.354166666664 | 2.93 |
| 44769.364583333336 | 3.05 |
| 44769.375 | 3.14 |
| 44769.385416666664 | 3.43 |
| 44769.395833333336 | 3.62 |
| 44769.40625 | 3.69 |
| 44769.416666666664 | 3.61 |
| 44769.427083333336 | 3.61 |
| 44769.4375 | 3.66 |
| 44769.447916666664 | 3.73 |
| 44769.458333333336 | 3.78 |
| 44769.46875 | 3.79 |
| 44769.479166666664 | 3.83 |
| 44769.489583333336 | 3.89 |
| 44769.5 | 3.9 |
| 44769.510416666664 | 3.87 |
| 44769.520833333336 | 3.92 |
| 44769.53125 | 3.58 |
| 44769.541666666664 | 3.51 |
| 44769.552083333336 | 3.87 |
| 44769.5625 | 3.95 |
| 44769.572916666664 | 3.79 |
| 44769.583333333336 | 3.83 |
| 44769.59375 | 3.93 |
| 44769.604166666664 | 3.94 |
| 44769.614583333336 | 4.14 |
| 44769.625 | 4.17 |
| 44769.635416666664 | 4.09 |
| 44769.645833333336 | 4.18 |
| 44769.65625 | 4.12 |
| 44769.666666666664 | 4.09 |
| 44769.677083333336 | 4.13 |
| 44769.6875 | 4.2 |
| 44769.697916666664 | 4.23 |
| 44769.708333333336 | 4.28 |
| 44769.71875 | 4.29 |
| 44769.729166666664 | 4.52 |
| 44769.739583333336 | 4.45 |
| 44769.75 | 4.61 |
| 44769.760416666664 | 4.66 |
| 44769.770833333336 | 4.93 |
| 44769.78125 | 4.7 |
| 44769.791666666664 | 4.7 |
| 44769.802083333336 | 4.47 |
| 44769.8125 | 4.42 |
| 44769.822916666664 | 4.53 |
| 44769.833333333336 | 4.55 |
| 44769.84375 | 4.6 |
| 44769.854166666664 | 4.64 |
| 44769.864583333336 | 4.69 |
| 44769.875 | 4.69 |
| 44769.885416666664 | 4.73 |
| 44769.895833333336 | 4.72 |
| 44769.90625 | 4.77 |
| 44769.916666666664 | 4.79 |
| 44769.927083333336 | 4.91 |
| 44769.9375 | 5 |
| 44769.947916666664 | 5.04 |
| 44769.958333333336 | 5.13 |
| 44769.96875 | 5.18 |
| 44769.979166666664 | 5.17 |
| 44769.989583333336 | 5.23 |
| 44770.0 | 5.28 |
| 44770.010416666664 | 5.3 |
| 44770.020833333336 | 5.3 |
| 44770.03125 | 5.28 |
| 44770.041666666664 | 5.23 |
| 44770.052083333336 | 4.94 |
| 44770.0625 | 4.78 |
| 44770.072916666664 | 4.98 |
| 44770.083333333336 | 4.9 |
| 44770.09375 | 4.89 |
| 44770.104166666664 | 4.63 |
| 44770.114583333336 | 4.35 |
| 44770.125 | 4.47 |
| 44770.135416666664 | 4.05 |
| 44770.145833333336 | 3.72 |
| 44770.15625 | 3.49 |
| 44770.166666666664 | 3.34 |
| 44770.177083333336 | 3.21 |
| 44770.1875 | 3.43 |
| 44770.197916666664 | 3.54 |
| 44770.208333333336 | 3.47 |
| 44770.21875 | 3.46 |
| 44770.229166666664 | 3.61 |
| 44770.239583333336 | 3.46 |
| 44770.25 | 3.66 |
| 44770.260416666664 | 3.62 |
| 44770.270833333336 | 3.65 |
| 44770.28125 | 3.85 |
| 44770.291666666664 | 3.79 |
| 44770.302083333336 | 3.59 |
| 44770.3125 | 3.79 |
| 44770.322916666664 | 3.52 |
| 44770.333333333336 | 3.47 |
| 44770.34375 | 3.46 |
| 44770.354166666664 | 3.46 |
| 44770.364583333336 | 3.4 |
| 44770.375 | 3.33 |
| 44770.385416666664 | 3.38 |
| 44770.395833333336 | 3.41 |
| 44770.40625 | 3.52 |
| 44770.416666666664 | 3.61 |
| 44770.427083333336 | 3.63 |
| 44770.4375 | 3.66 |
| 44770.447916666664 | 3.64 |
| 44770.458333333336 | 3.65 |
| 44770.46875 | 3.66 |
| 44770.479166666664 | 3.7 |
| 44770.489583333336 | 3.64 |
| 44770.5 | 3.61 |
| 44770.510416666664 | 3.61 |
| 44770.520833333336 | 3.62 |
| 44770.53125 | 3.62 |
| 44770.541666666664 | 3.66 |
| 44770.552083333336 | 3.63 |
| 44770.5625 | 3.62 |
| 44770.572916666664 | 3.65 |
| 44770.583333333336 | 3.52 |
| 44770.59375 | 3.81 |
| 44770.604166666664 | 3.81 |
| 44770.614583333336 | 3.94 |
| 44770.625 | 4.07 |
| 44770.635416666664 | 4.2 |
| 44770.645833333336 | 4.33 |
| 44770.65625 | 4.23 |
| 44770.666666666664 | 4.29 |
| 44770.677083333336 | 4.23 |
| 44770.6875 | 4.33 |
| 44770.697916666664 | 4.4 |
| 44770.708333333336 | 4.54 |
| 44770.71875 | 4.76 |
| 44770.729166666664 | 4.92 |
| 44770.739583333336 | 5.21 |
| 44770.75 | 5.38 |
| 44770.760416666664 | 5.64 |
| 44770.770833333336 | 6.13 |
| 44770.78125 | 6.43 |
| 44770.791666666664 | 6.09 |
| 44770.802083333336 | 6.01 |
| 44770.8125 | 6.35 |
| 44770.822916666664 | 6.11 |
| 44770.833333333336 | 6.09 |
| 44770.84375 | 5.96 |
| 44770.854166666664 | 6.1 |
| 44770.864583333336 | 5.73 |
| 44770.875 | 5.62 |
| 44770.885416666664 | 5.53 |
| 44770.895833333336 | 5.4 |
| 44770.90625 | 5.22 |
| 44770.916666666664 | 5.09 |
| 44770.927083333336 | 4.99 |
| 44770.9375 | 4.99 |
| 44770.947916666664 | 5.01 |
| 44770.958333333336 | 5.03 |
| 44770.96875 | 5.07 |
| 44770.979166666664 | 5.12 |
| 44770.989583333336 | 5.22 |
| 44771.0 | 5.33 |
| 44771.010416666664 | 5.4 |
| 44771.020833333336 | 5.43 |
| 44771.03125 | 5.41 |
| 44771.041666666664 | 5.4 |
| 44771.052083333336 | 5.36 |
| 44771.0625 | 5.3 |
| 44771.072916666664 | 5.25 |
| 44771.083333333336 | 5.12 |
| 44771.09375 | 4.93 |
| 44771.104166666664 | 5.01 |
| 44771.114583333336 | 4.91 |
| 44771.125 | 4.79 |
| 44771.135416666664 | 4.73 |
| 44771.145833333336 | 4.56 |
| 44771.15625 | 4.6 |
| 44771.166666666664 | 4.33 |
| 44771.177083333336 | 3.87 |
| 44771.1875 | 3.43 |
| 44771.197916666664 | 3.23 |
| 44771.208333333336 | 3.33 |
| 44771.21875 | 3.52 |
| 44771.229166666664 | 3.72 |
| 44771.239583333336 | 3.68 |
| 44771.25 | 3.85 |
| 44771.260416666664 | 3.75 |
| 44771.270833333336 | 3.8 |
| 44771.28125 | 3.78 |
| 44771.291666666664 | 3.77 |
| 44771.302083333336 | 3.76 |
| 44771.3125 | 3.74 |
| 44771.322916666664 | 3.68 |
| 44771.333333333336 | 3.19 |
| 44771.34375 | 3.49 |
| 44771.354166666664 | 3.38 |
| 44771.364583333336 | 3.35 |
| 44771.375 | 3.36 |
| 44771.385416666664 | 3.28 |
| 44771.395833333336 | 3.19 |
| 44771.40625 | 3.22 |
| 44771.416666666664 | 3.27 |
| 44771.427083333336 | 3.34 |
| 44771.4375 | 3.39 |
| 44771.447916666664 | 3.33 |
| 44771.458333333336 | 3.32 |
| 44771.46875 | 3.32 |
| 44771.479166666664 | 3.32 |
| 44771.489583333336 | 3.32 |
| 44771.5 | 3.32 |
| 44771.510416666664 | 3.33 |
| 44771.520833333336 | 3.38 |
| 44771.53125 | 3.44 |
| 44771.541666666664 | 3.44 |
| 44771.552083333336 | 3.5 |
| 44771.5625 | 3.55 |
| 44771.572916666664 | 3.49 |
| 44771.583333333336 | 3.54 |
| 44771.59375 | 3.56 |
| 44771.604166666664 | 3.48 |
| 44771.614583333336 | 3.51 |
| 44771.625 | 3.71 |
| 44771.635416666664 | 3.87 |
| 44771.645833333336 | 3.86 |
| 44771.65625 | 3.86 |
| 44771.666666666664 | 3.84 |
| 44771.677083333336 | 3.84 |
| 44771.6875 | 4.05 |
| 44771.697916666664 | 4.04 |
| 44771.708333333336 | 4.11 |
| 44771.71875 | 4.27 |
| 44771.729166666664 | 4.5 |
| 44771.739583333336 | 4.81 |
| 44771.75 | 5 |
| 44771.760416666664 | 5.13 |
| 44771.770833333336 | 5.43 |
| 44771.78125 | 5.73 |
| 44771.791666666664 | 6.04 |
| 44771.802083333336 | 6.14 |
| 44771.8125 | 6.27 |
| 44771.822916666664 | 6.14 |
| 44771.833333333336 | 6.02 |
| 44771.84375 | 5.81 |
| 44771.854166666664 | 5.55 |
| 44771.864583333336 | 5.34 |
| 44771.875 | 5.06 |
| 44771.885416666664 | 4.98 |
| 44771.895833333336 | 5.05 |
| 44771.90625 | 5.04 |
| 44771.916666666664 | 4.91 |
| 44771.927083333336 | 4.85 |
| 44771.9375 | 4.74 |
| 44771.947916666664 | 4.67 |
| 44771.958333333336 | 4.67 |
| 44771.96875 | 4.67 |
| 44771.979166666664 | 4.66 |
| 44771.989583333336 | 4.69 |
| 44772.0 | 4.76 |
| 44772.010416666664 | 4.85 |
| 44772.020833333336 | 4.94 |
| 44772.03125 | 4.99 |
| 44772.041666666664 | 5.01 |
| 44772.052083333336 | 4.97 |
| 44772.0625 | 4.93 |
| 44772.072916666664 | 4.91 |
| 44772.083333333336 | 4.83 |
| 44772.09375 | 4.72 |
| 44772.104166666664 | 4.64 |
| 44772.114583333336 | 4.54 |
| 44772.125 | 4.51 |
| 44772.135416666664 | 4.44 |
| 44772.145833333336 | 4.5 |
| 44772.15625 | 4.38 |
| 44772.166666666664 | 4.15 |
| 44772.177083333336 | 3.97 |
| 44772.1875 | 3.88 |
| 44772.197916666664 | 3.59 |
| 44772.208333333336 | 3.89 |
| 44772.21875 | 3.55 |
| 44772.229166666664 | 3.58 |
| 44772.239583333336 | 3.36 |
| 44772.25 | 3.38 |
| 44772.260416666664 | 3.39 |
| 44772.270833333336 | 3.19 |
| 44772.28125 | 3.15 |
| 44772.291666666664 | 3.12 |
| 44772.302083333336 | 3 |
| 44772.3125 | 3.02 |
| 44772.322916666664 | 2.89 |
| 44772.333333333336 | 2.85 |
| 44772.34375 | 2.77 |
| 44772.354166666664 | 2.76 |
| 44772.364583333336 | 2.74 |
| 44772.375 | 2.67 |
| 44772.385416666664 | 2.66 |
| 44772.395833333336 | 2.71 |
| 44772.40625 | 2.68 |
| 44772.416666666664 | 2.72 |
| 44772.427083333336 | 2.83 |
| 44772.4375 | 2.93 |
| 44772.447916666664 | 3.02 |
| 44772.458333333336 | 3.11 |
| 44772.46875 | 3.18 |
| 44772.479166666664 | 3.27 |
| 44772.489583333336 | 3.31 |
| 44772.5 | 3.37 |
| 44772.510416666664 | 3.39 |
| 44772.520833333336 | 3.44 |
| 44772.53125 | 3.45 |
| 44772.541666666664 | 3.49 |
| 44772.552083333336 | 3.53 |
| 44772.5625 | 3.59 |
| 44772.572916666664 | 3.63 |
| 44772.583333333336 | 3.7 |
| 44772.59375 | 3.76 |
| 44772.604166666664 | 3.84 |
| 44772.614583333336 | 3.79 |
| 44772.625 | 3.84 |
| 44772.635416666664 | 4.02 |
| 44772.645833333336 | 4.08 |
| 44772.65625 | 4.22 |
| 44772.666666666664 | 4.45 |
| 44772.677083333336 | 4.58 |
| 44772.6875 | 4.67 |
| 44772.697916666664 | 4.68 |
| 44772.708333333336 | 4.7 |
| 44772.71875 | 4.73 |
| 44772.729166666664 | 4.84 |
| 44772.739583333336 | 4.98 |
| 44772.75 | 5.15 |
| 44772.760416666664 | 5.24 |
| 44772.770833333336 | 5.36 |
| 44772.78125 | 5.44 |
| 44772.791666666664 | 5.54 |
| 44772.802083333336 | 5.7 |
| 44772.8125 | 5.87 |
| 44772.822916666664 | 6.1 |
| 44772.833333333336 | 6.34 |
| 44772.84375 | 6.45 |
| 44772.854166666664 | 6.1 |
| 44772.864583333336 | 6.66 |
| 44772.875 | 6.4 |
| 44772.885416666664 | 6.16 |
| 44772.895833333336 | 5.98 |
| 44772.90625 | 5.79 |
| 44772.916666666664 | 5.69 |
| 44772.927083333336 | 5.6 |
| 44772.9375 | 5.63 |
| 44772.947916666664 | 5.57 |
| 44772.958333333336 | 5.56 |
| 44772.96875 | 5.54 |
| 44772.979166666664 | 5.45 |
| 44772.989583333336 | 5.34 |
| 44773.0 | 5.24 |
| 44773.010416666664 | 5.16 |
| 44773.020833333336 | 5.1 |
| 44773.03125 | 5.08 |
| 44773.041666666664 | 5.15 |
| 44773.052083333336 | 5.21 |
| 44773.0625 | 5.27 |
| 44773.072916666664 | 5.28 |
| 44773.083333333336 | 5.3 |
| 44773.09375 | 5.31 |
| 44773.104166666664 | 5.26 |
| 44773.114583333336 | 5.27 |
| 44773.125 | 5.24 |
| 44773.135416666664 | 4.68 |
| 44773.145833333336 | 4.86 |
| 44773.15625 | 5.1 |
| 44773.166666666664 | 4.95 |
| 44773.177083333336 | 4.91 |
| 44773.1875 | 4.54 |
| 44773.197916666664 | 4.37 |
| 44773.208333333336 | 4.14 |
| 44773.21875 | 4.01 |
| 44773.229166666664 | 3.96 |
| 44773.239583333336 | 3.9 |
| 44773.25 | 4.01 |
| 44773.260416666664 | 3.91 |
| 44773.270833333336 | 4.2 |
| 44773.28125 | 4.1 |
| 44773.291666666664 | 4.11 |
| 44773.302083333336 | 4.08 |
| 44773.3125 | 4 |
| 44773.322916666664 | 4.05 |
| 44773.333333333336 | 4.03 |
| 44773.34375 | 3.98 |
| 44773.354166666664 | 3.93 |
| 44773.364583333336 | 3.79 |
| 44773.375 | 3.59 |
| 44773.385416666664 | 3.67 |
| 44773.395833333336 | 3.65 |
| 44773.40625 | 3.59 |
| 44773.416666666664 | 3.53 |
| 44773.427083333336 | 3.57 |
| 44773.4375 | 3.51 |
| 44773.447916666664 | 3.47 |
| 44773.458333333336 | 3.46 |
| 44773.46875 | 3.53 |
| 44773.479166666664 | 3.55 |
| 44773.489583333336 | 3.56 |
| 44773.5 | 3.61 |
| 44773.510416666664 | 3.61 |
| 44773.520833333336 | 3.6 |
| 44773.53125 | 3.63 |
| 44773.541666666664 | 3.7 |
| 44773.552083333336 | 3.72 |
| 44773.5625 | 3.79 |
| 44773.572916666664 | 3.81 |
| 44773.583333333336 | 3.91 |
| 44773.59375 | 3.88 |
| 44773.604166666664 | 4.05 |
| 44773.614583333336 | 3.94 |
| 44773.625 | 3.98 |
| 44773.635416666664 | 4.01 |
| 44773.645833333336 | 3.85 |
| 44773.65625 | 4.07 |
| 44773.666666666664 | 4.44 |
| 44773.677083333336 | 4.82 |
| 44773.6875 | 4.62 |
| 44773.697916666664 | 4.8 |
| 44773.708333333336 | 4.81 |
| 44773.71875 | 4.93 |
| 44773.729166666664 | 4.68 |
| 44773.739583333336 | 4.88 |
| 44773.75 | 4.86 |
| 44773.760416666664 | 5.01 |
| 44773.770833333336 | 5.23 |
| 44773.78125 | 5.46 |
| 44773.791666666664 | 5.56 |
| 44773.802083333336 | 5.68 |
| 44773.8125 | 5.72 |
| 44773.822916666664 | 5.77 |
| 44773.833333333336 | 5.79 |
| 44773.84375 | 5.83 |
| 44773.854166666664 | 5.85 |
| 44773.864583333336 | 5.87 |
| 44773.875 | 5.85 |
| 44773.885416666664 | 5.66 |
| 44773.895833333336 | 5.87 |
| 44773.90625 | 5.73 |
| 44773.916666666664 | 5.44 |
| 44773.927083333336 | 5.43 |
| 44773.9375 | 5.26 |
| 44773.947916666664 | 5.26 |
| 44773.958333333336 | 5.3 |
| 44773.96875 | 5.24 |
| 44773.979166666664 | 5.19 |
| 44773.989583333336 | 5.1 |
| 44774.0 | 5 |
| 44774.010416666664 | 4.9 |
| 44774.020833333336 | 4.82 |
| 44774.03125 | 4.79 |
| 44774.041666666664 | 4.82 |
| 44774.052083333336 | 4.93 |
| 44774.0625 | 4.98 |
| 44774.072916666664 | 4.99 |
| 44774.083333333336 | 5.16 |
| 44774.09375 | 5.12 |
| 44774.104166666664 | 5.06 |
| 44774.114583333336 | 5.01 |
| 44774.125 | 5.06 |
| 44774.135416666664 | 4.94 |
| 44774.145833333336 | 4.92 |
| 44774.15625 | 4.89 |